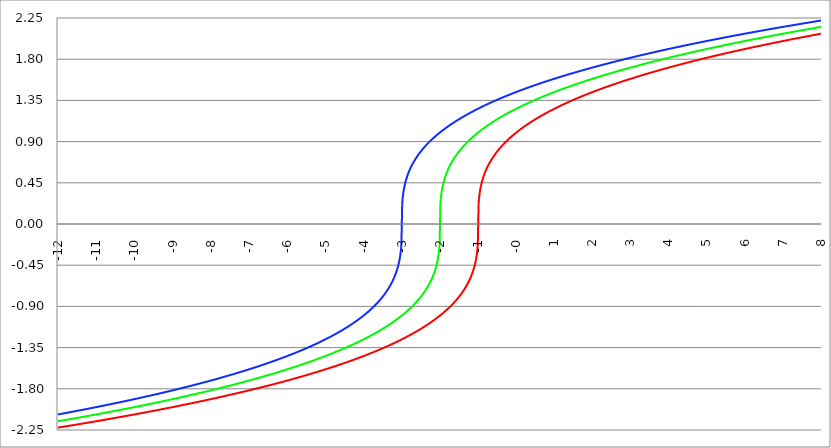
| Category | Series 1 | Series 0 | Series 2 |
|---|---|---|---|
| -12.0 | -2.224 | -2.154 | -2.08 |
| -11.99 | -2.223 | -2.154 | -2.079 |
| -11.98 | -2.223 | -2.153 | -2.079 |
| -11.97 | -2.222 | -2.152 | -2.078 |
| -11.96 | -2.221 | -2.152 | -2.077 |
| -11.95 | -2.221 | -2.151 | -2.076 |
| -11.94 | -2.22 | -2.15 | -2.075 |
| -11.93 | -2.219 | -2.149 | -2.075 |
| -11.92 | -2.219 | -2.149 | -2.074 |
| -11.91 | -2.218 | -2.148 | -2.073 |
| -11.9 | -2.217 | -2.147 | -2.072 |
| -11.89 | -2.217 | -2.147 | -2.072 |
| -11.88 | -2.216 | -2.146 | -2.071 |
| -11.87 | -2.215 | -2.145 | -2.07 |
| -11.86 | -2.215 | -2.144 | -2.069 |
| -11.85 | -2.214 | -2.144 | -2.068 |
| -11.84 | -2.213 | -2.143 | -2.068 |
| -11.83 | -2.212 | -2.142 | -2.067 |
| -11.82 | -2.212 | -2.141 | -2.066 |
| -11.81 | -2.211 | -2.141 | -2.065 |
| -11.8 | -2.21 | -2.14 | -2.065 |
| -11.79 | -2.21 | -2.139 | -2.064 |
| -11.78 | -2.209 | -2.139 | -2.063 |
| -11.77 | -2.208 | -2.138 | -2.062 |
| -11.76000000000001 | -2.208 | -2.137 | -2.061 |
| -11.75000000000001 | -2.207 | -2.136 | -2.061 |
| -11.74000000000001 | -2.206 | -2.136 | -2.06 |
| -11.73000000000001 | -2.206 | -2.135 | -2.059 |
| -11.72000000000001 | -2.205 | -2.134 | -2.058 |
| -11.71000000000001 | -2.204 | -2.133 | -2.057 |
| -11.70000000000001 | -2.204 | -2.133 | -2.057 |
| -11.69000000000001 | -2.203 | -2.132 | -2.056 |
| -11.68000000000001 | -2.202 | -2.131 | -2.055 |
| -11.67000000000001 | -2.202 | -2.13 | -2.054 |
| -11.66000000000001 | -2.201 | -2.13 | -2.054 |
| -11.65000000000001 | -2.2 | -2.129 | -2.053 |
| -11.64000000000001 | -2.199 | -2.128 | -2.052 |
| -11.63000000000001 | -2.199 | -2.128 | -2.051 |
| -11.62000000000001 | -2.198 | -2.127 | -2.05 |
| -11.61000000000001 | -2.197 | -2.126 | -2.05 |
| -11.60000000000001 | -2.197 | -2.125 | -2.049 |
| -11.59000000000001 | -2.196 | -2.125 | -2.048 |
| -11.58000000000001 | -2.195 | -2.124 | -2.047 |
| -11.57000000000001 | -2.195 | -2.123 | -2.046 |
| -11.56000000000001 | -2.194 | -2.122 | -2.046 |
| -11.55000000000001 | -2.193 | -2.122 | -2.045 |
| -11.54000000000001 | -2.193 | -2.121 | -2.044 |
| -11.53000000000001 | -2.192 | -2.12 | -2.043 |
| -11.52000000000001 | -2.191 | -2.119 | -2.042 |
| -11.51000000000001 | -2.19 | -2.119 | -2.042 |
| -11.50000000000001 | -2.19 | -2.118 | -2.041 |
| -11.49000000000001 | -2.189 | -2.117 | -2.04 |
| -11.48000000000001 | -2.188 | -2.116 | -2.039 |
| -11.47000000000001 | -2.188 | -2.116 | -2.038 |
| -11.46000000000001 | -2.187 | -2.115 | -2.038 |
| -11.45000000000001 | -2.186 | -2.114 | -2.037 |
| -11.44000000000001 | -2.186 | -2.113 | -2.036 |
| -11.43000000000001 | -2.185 | -2.113 | -2.035 |
| -11.42000000000001 | -2.184 | -2.112 | -2.034 |
| -11.41000000000001 | -2.183 | -2.111 | -2.034 |
| -11.40000000000001 | -2.183 | -2.11 | -2.033 |
| -11.39000000000001 | -2.182 | -2.11 | -2.032 |
| -11.38000000000001 | -2.181 | -2.109 | -2.031 |
| -11.37000000000001 | -2.181 | -2.108 | -2.03 |
| -11.36000000000001 | -2.18 | -2.107 | -2.03 |
| -11.35000000000001 | -2.179 | -2.107 | -2.029 |
| -11.34000000000001 | -2.179 | -2.106 | -2.028 |
| -11.33000000000001 | -2.178 | -2.105 | -2.027 |
| -11.32000000000001 | -2.177 | -2.104 | -2.026 |
| -11.31000000000001 | -2.176 | -2.104 | -2.026 |
| -11.30000000000001 | -2.176 | -2.103 | -2.025 |
| -11.29000000000002 | -2.175 | -2.102 | -2.024 |
| -11.28000000000002 | -2.174 | -2.101 | -2.023 |
| -11.27000000000002 | -2.174 | -2.101 | -2.022 |
| -11.26000000000002 | -2.173 | -2.1 | -2.021 |
| -11.25000000000002 | -2.172 | -2.099 | -2.021 |
| -11.24000000000002 | -2.172 | -2.098 | -2.02 |
| -11.23000000000002 | -2.171 | -2.098 | -2.019 |
| -11.22000000000002 | -2.17 | -2.097 | -2.018 |
| -11.21000000000002 | -2.169 | -2.096 | -2.017 |
| -11.20000000000002 | -2.169 | -2.095 | -2.017 |
| -11.19000000000002 | -2.168 | -2.095 | -2.016 |
| -11.18000000000002 | -2.167 | -2.094 | -2.015 |
| -11.17000000000002 | -2.167 | -2.093 | -2.014 |
| -11.16000000000002 | -2.166 | -2.092 | -2.013 |
| -11.15000000000002 | -2.165 | -2.092 | -2.012 |
| -11.14000000000002 | -2.164 | -2.091 | -2.012 |
| -11.13000000000002 | -2.164 | -2.09 | -2.011 |
| -11.12000000000002 | -2.163 | -2.089 | -2.01 |
| -11.11000000000002 | -2.162 | -2.089 | -2.009 |
| -11.10000000000002 | -2.162 | -2.088 | -2.008 |
| -11.09000000000002 | -2.161 | -2.087 | -2.007 |
| -11.08000000000002 | -2.16 | -2.086 | -2.007 |
| -11.07000000000002 | -2.159 | -2.085 | -2.006 |
| -11.06000000000002 | -2.159 | -2.085 | -2.005 |
| -11.05000000000002 | -2.158 | -2.084 | -2.004 |
| -11.04000000000002 | -2.157 | -2.083 | -2.003 |
| -11.03000000000002 | -2.157 | -2.082 | -2.002 |
| -11.02000000000002 | -2.156 | -2.082 | -2.002 |
| -11.01000000000002 | -2.155 | -2.081 | -2.001 |
| -11.00000000000002 | -2.154 | -2.08 | -2 |
| -10.99000000000002 | -2.154 | -2.079 | -1.999 |
| -10.98000000000002 | -2.153 | -2.079 | -1.998 |
| -10.97000000000002 | -2.152 | -2.078 | -1.997 |
| -10.96000000000002 | -2.152 | -2.077 | -1.997 |
| -10.95000000000002 | -2.151 | -2.076 | -1.996 |
| -10.94000000000002 | -2.15 | -2.075 | -1.995 |
| -10.93000000000002 | -2.149 | -2.075 | -1.994 |
| -10.92000000000002 | -2.149 | -2.074 | -1.993 |
| -10.91000000000002 | -2.148 | -2.073 | -1.992 |
| -10.90000000000002 | -2.147 | -2.072 | -1.992 |
| -10.89000000000002 | -2.147 | -2.072 | -1.991 |
| -10.88000000000002 | -2.146 | -2.071 | -1.99 |
| -10.87000000000002 | -2.145 | -2.07 | -1.989 |
| -10.86000000000002 | -2.144 | -2.069 | -1.988 |
| -10.85000000000002 | -2.144 | -2.068 | -1.987 |
| -10.84000000000002 | -2.143 | -2.068 | -1.987 |
| -10.83000000000002 | -2.142 | -2.067 | -1.986 |
| -10.82000000000003 | -2.141 | -2.066 | -1.985 |
| -10.81000000000003 | -2.141 | -2.065 | -1.984 |
| -10.80000000000003 | -2.14 | -2.065 | -1.983 |
| -10.79000000000003 | -2.139 | -2.064 | -1.982 |
| -10.78000000000003 | -2.139 | -2.063 | -1.981 |
| -10.77000000000003 | -2.138 | -2.062 | -1.981 |
| -10.76000000000003 | -2.137 | -2.061 | -1.98 |
| -10.75000000000003 | -2.136 | -2.061 | -1.979 |
| -10.74000000000003 | -2.136 | -2.06 | -1.978 |
| -10.73000000000003 | -2.135 | -2.059 | -1.977 |
| -10.72000000000003 | -2.134 | -2.058 | -1.976 |
| -10.71000000000003 | -2.133 | -2.057 | -1.976 |
| -10.70000000000003 | -2.133 | -2.057 | -1.975 |
| -10.69000000000003 | -2.132 | -2.056 | -1.974 |
| -10.68000000000003 | -2.131 | -2.055 | -1.973 |
| -10.67000000000003 | -2.13 | -2.054 | -1.972 |
| -10.66000000000003 | -2.13 | -2.054 | -1.971 |
| -10.65000000000003 | -2.129 | -2.053 | -1.97 |
| -10.64000000000003 | -2.128 | -2.052 | -1.97 |
| -10.63000000000003 | -2.128 | -2.051 | -1.969 |
| -10.62000000000003 | -2.127 | -2.05 | -1.968 |
| -10.61000000000003 | -2.126 | -2.05 | -1.967 |
| -10.60000000000003 | -2.125 | -2.049 | -1.966 |
| -10.59000000000003 | -2.125 | -2.048 | -1.965 |
| -10.58000000000003 | -2.124 | -2.047 | -1.964 |
| -10.57000000000003 | -2.123 | -2.046 | -1.964 |
| -10.56000000000003 | -2.122 | -2.046 | -1.963 |
| -10.55000000000003 | -2.122 | -2.045 | -1.962 |
| -10.54000000000003 | -2.121 | -2.044 | -1.961 |
| -10.53000000000003 | -2.12 | -2.043 | -1.96 |
| -10.52000000000003 | -2.119 | -2.042 | -1.959 |
| -10.51000000000003 | -2.119 | -2.042 | -1.958 |
| -10.50000000000003 | -2.118 | -2.041 | -1.957 |
| -10.49000000000003 | -2.117 | -2.04 | -1.957 |
| -10.48000000000003 | -2.116 | -2.039 | -1.956 |
| -10.47000000000003 | -2.116 | -2.038 | -1.955 |
| -10.46000000000003 | -2.115 | -2.038 | -1.954 |
| -10.45000000000003 | -2.114 | -2.037 | -1.953 |
| -10.44000000000003 | -2.113 | -2.036 | -1.952 |
| -10.43000000000003 | -2.113 | -2.035 | -1.951 |
| -10.42000000000003 | -2.112 | -2.034 | -1.95 |
| -10.41000000000003 | -2.111 | -2.034 | -1.95 |
| -10.40000000000003 | -2.11 | -2.033 | -1.949 |
| -10.39000000000003 | -2.11 | -2.032 | -1.948 |
| -10.38000000000003 | -2.109 | -2.031 | -1.947 |
| -10.37000000000003 | -2.108 | -2.03 | -1.946 |
| -10.36000000000003 | -2.107 | -2.03 | -1.945 |
| -10.35000000000004 | -2.107 | -2.029 | -1.944 |
| -10.34000000000004 | -2.106 | -2.028 | -1.943 |
| -10.33000000000004 | -2.105 | -2.027 | -1.943 |
| -10.32000000000004 | -2.104 | -2.026 | -1.942 |
| -10.31000000000004 | -2.104 | -2.026 | -1.941 |
| -10.30000000000004 | -2.103 | -2.025 | -1.94 |
| -10.29000000000004 | -2.102 | -2.024 | -1.939 |
| -10.28000000000004 | -2.101 | -2.023 | -1.938 |
| -10.27000000000004 | -2.101 | -2.022 | -1.937 |
| -10.26000000000004 | -2.1 | -2.021 | -1.936 |
| -10.25000000000004 | -2.099 | -2.021 | -1.935 |
| -10.24000000000004 | -2.098 | -2.02 | -1.935 |
| -10.23000000000004 | -2.098 | -2.019 | -1.934 |
| -10.22000000000004 | -2.097 | -2.018 | -1.933 |
| -10.21000000000004 | -2.096 | -2.017 | -1.932 |
| -10.20000000000004 | -2.095 | -2.017 | -1.931 |
| -10.19000000000004 | -2.095 | -2.016 | -1.93 |
| -10.18000000000004 | -2.094 | -2.015 | -1.929 |
| -10.17000000000004 | -2.093 | -2.014 | -1.928 |
| -10.16000000000004 | -2.092 | -2.013 | -1.927 |
| -10.15000000000004 | -2.092 | -2.012 | -1.926 |
| -10.14000000000004 | -2.091 | -2.012 | -1.926 |
| -10.13000000000004 | -2.09 | -2.011 | -1.925 |
| -10.12000000000004 | -2.089 | -2.01 | -1.924 |
| -10.11000000000004 | -2.089 | -2.009 | -1.923 |
| -10.10000000000004 | -2.088 | -2.008 | -1.922 |
| -10.09000000000004 | -2.087 | -2.007 | -1.921 |
| -10.08000000000004 | -2.086 | -2.007 | -1.92 |
| -10.07000000000004 | -2.085 | -2.006 | -1.919 |
| -10.06000000000004 | -2.085 | -2.005 | -1.918 |
| -10.05000000000004 | -2.084 | -2.004 | -1.917 |
| -10.04000000000004 | -2.083 | -2.003 | -1.917 |
| -10.03000000000004 | -2.082 | -2.002 | -1.916 |
| -10.02000000000004 | -2.082 | -2.002 | -1.915 |
| -10.01000000000004 | -2.081 | -2.001 | -1.914 |
| -10.00000000000004 | -2.08 | -2 | -1.913 |
| -9.990000000000043 | -2.079 | -1.999 | -1.912 |
| -9.980000000000043 | -2.079 | -1.998 | -1.911 |
| -9.970000000000043 | -2.078 | -1.997 | -1.91 |
| -9.960000000000043 | -2.077 | -1.997 | -1.909 |
| -9.950000000000044 | -2.076 | -1.996 | -1.908 |
| -9.940000000000042 | -2.075 | -1.995 | -1.907 |
| -9.930000000000044 | -2.075 | -1.994 | -1.907 |
| -9.920000000000044 | -2.074 | -1.993 | -1.906 |
| -9.910000000000045 | -2.073 | -1.992 | -1.905 |
| -9.900000000000045 | -2.072 | -1.992 | -1.904 |
| -9.890000000000043 | -2.072 | -1.991 | -1.903 |
| -9.880000000000045 | -2.071 | -1.99 | -1.902 |
| -9.870000000000045 | -2.07 | -1.989 | -1.901 |
| -9.860000000000046 | -2.069 | -1.988 | -1.9 |
| -9.850000000000046 | -2.068 | -1.987 | -1.899 |
| -9.840000000000044 | -2.068 | -1.987 | -1.898 |
| -9.830000000000046 | -2.067 | -1.986 | -1.897 |
| -9.820000000000046 | -2.066 | -1.985 | -1.896 |
| -9.810000000000047 | -2.065 | -1.984 | -1.895 |
| -9.800000000000045 | -2.065 | -1.983 | -1.895 |
| -9.790000000000047 | -2.064 | -1.982 | -1.894 |
| -9.780000000000047 | -2.063 | -1.981 | -1.893 |
| -9.770000000000048 | -2.062 | -1.981 | -1.892 |
| -9.760000000000048 | -2.061 | -1.98 | -1.891 |
| -9.750000000000046 | -2.061 | -1.979 | -1.89 |
| -9.740000000000048 | -2.06 | -1.978 | -1.889 |
| -9.730000000000048 | -2.059 | -1.977 | -1.888 |
| -9.720000000000049 | -2.058 | -1.976 | -1.887 |
| -9.710000000000049 | -2.057 | -1.976 | -1.886 |
| -9.700000000000047 | -2.057 | -1.975 | -1.885 |
| -9.69000000000005 | -2.056 | -1.974 | -1.884 |
| -9.68000000000005 | -2.055 | -1.973 | -1.883 |
| -9.67000000000005 | -2.054 | -1.972 | -1.882 |
| -9.66000000000005 | -2.054 | -1.971 | -1.881 |
| -9.65000000000005 | -2.053 | -1.97 | -1.881 |
| -9.64000000000005 | -2.052 | -1.97 | -1.88 |
| -9.63000000000005 | -2.051 | -1.969 | -1.879 |
| -9.62000000000005 | -2.05 | -1.968 | -1.878 |
| -9.610000000000051 | -2.05 | -1.967 | -1.877 |
| -9.600000000000051 | -2.049 | -1.966 | -1.876 |
| -9.590000000000051 | -2.048 | -1.965 | -1.875 |
| -9.580000000000052 | -2.047 | -1.964 | -1.874 |
| -9.570000000000052 | -2.046 | -1.964 | -1.873 |
| -9.560000000000052 | -2.046 | -1.963 | -1.872 |
| -9.550000000000052 | -2.045 | -1.962 | -1.871 |
| -9.540000000000052 | -2.044 | -1.961 | -1.87 |
| -9.530000000000053 | -2.043 | -1.96 | -1.869 |
| -9.520000000000053 | -2.042 | -1.959 | -1.868 |
| -9.510000000000053 | -2.042 | -1.958 | -1.867 |
| -9.500000000000053 | -2.041 | -1.957 | -1.866 |
| -9.490000000000054 | -2.04 | -1.957 | -1.865 |
| -9.480000000000054 | -2.039 | -1.956 | -1.864 |
| -9.470000000000052 | -2.038 | -1.955 | -1.863 |
| -9.460000000000054 | -2.038 | -1.954 | -1.862 |
| -9.450000000000054 | -2.037 | -1.953 | -1.861 |
| -9.440000000000055 | -2.036 | -1.952 | -1.86 |
| -9.430000000000055 | -2.035 | -1.951 | -1.86 |
| -9.420000000000055 | -2.034 | -1.95 | -1.859 |
| -9.410000000000055 | -2.034 | -1.95 | -1.858 |
| -9.400000000000055 | -2.033 | -1.949 | -1.857 |
| -9.390000000000056 | -2.032 | -1.948 | -1.856 |
| -9.380000000000056 | -2.031 | -1.947 | -1.855 |
| -9.370000000000056 | -2.03 | -1.946 | -1.854 |
| -9.360000000000056 | -2.03 | -1.945 | -1.853 |
| -9.350000000000056 | -2.029 | -1.944 | -1.852 |
| -9.340000000000057 | -2.028 | -1.943 | -1.851 |
| -9.330000000000057 | -2.027 | -1.943 | -1.85 |
| -9.320000000000057 | -2.026 | -1.942 | -1.849 |
| -9.310000000000057 | -2.026 | -1.941 | -1.848 |
| -9.300000000000058 | -2.025 | -1.94 | -1.847 |
| -9.290000000000058 | -2.024 | -1.939 | -1.846 |
| -9.280000000000058 | -2.023 | -1.938 | -1.845 |
| -9.270000000000058 | -2.022 | -1.937 | -1.844 |
| -9.260000000000058 | -2.021 | -1.936 | -1.843 |
| -9.250000000000059 | -2.021 | -1.935 | -1.842 |
| -9.240000000000059 | -2.02 | -1.935 | -1.841 |
| -9.230000000000059 | -2.019 | -1.934 | -1.84 |
| -9.22000000000006 | -2.018 | -1.933 | -1.839 |
| -9.21000000000006 | -2.017 | -1.932 | -1.838 |
| -9.20000000000006 | -2.017 | -1.931 | -1.837 |
| -9.19000000000006 | -2.016 | -1.93 | -1.836 |
| -9.18000000000006 | -2.015 | -1.929 | -1.835 |
| -9.17000000000006 | -2.014 | -1.928 | -1.834 |
| -9.16000000000006 | -2.013 | -1.927 | -1.833 |
| -9.15000000000006 | -2.012 | -1.926 | -1.832 |
| -9.140000000000061 | -2.012 | -1.926 | -1.831 |
| -9.130000000000061 | -2.011 | -1.925 | -1.83 |
| -9.120000000000061 | -2.01 | -1.924 | -1.829 |
| -9.110000000000062 | -2.009 | -1.923 | -1.828 |
| -9.100000000000062 | -2.008 | -1.922 | -1.827 |
| -9.090000000000062 | -2.007 | -1.921 | -1.826 |
| -9.080000000000062 | -2.007 | -1.92 | -1.825 |
| -9.070000000000062 | -2.006 | -1.919 | -1.824 |
| -9.060000000000063 | -2.005 | -1.918 | -1.823 |
| -9.050000000000063 | -2.004 | -1.917 | -1.822 |
| -9.040000000000063 | -2.003 | -1.917 | -1.821 |
| -9.030000000000063 | -2.002 | -1.916 | -1.82 |
| -9.020000000000064 | -2.002 | -1.915 | -1.819 |
| -9.010000000000064 | -2.001 | -1.914 | -1.818 |
| -9.000000000000062 | -2 | -1.913 | -1.817 |
| -8.990000000000064 | -1.999 | -1.912 | -1.816 |
| -8.980000000000064 | -1.998 | -1.911 | -1.815 |
| -8.970000000000065 | -1.997 | -1.91 | -1.814 |
| -8.960000000000065 | -1.997 | -1.909 | -1.813 |
| -8.950000000000063 | -1.996 | -1.908 | -1.812 |
| -8.940000000000065 | -1.995 | -1.907 | -1.811 |
| -8.930000000000065 | -1.994 | -1.907 | -1.81 |
| -8.920000000000066 | -1.993 | -1.906 | -1.809 |
| -8.910000000000066 | -1.992 | -1.905 | -1.808 |
| -8.900000000000066 | -1.992 | -1.904 | -1.807 |
| -8.890000000000066 | -1.991 | -1.903 | -1.806 |
| -8.880000000000067 | -1.99 | -1.902 | -1.805 |
| -8.870000000000067 | -1.989 | -1.901 | -1.804 |
| -8.860000000000065 | -1.988 | -1.9 | -1.803 |
| -8.850000000000067 | -1.987 | -1.899 | -1.802 |
| -8.840000000000067 | -1.987 | -1.898 | -1.801 |
| -8.830000000000068 | -1.986 | -1.897 | -1.8 |
| -8.820000000000068 | -1.985 | -1.896 | -1.799 |
| -8.810000000000066 | -1.984 | -1.895 | -1.798 |
| -8.800000000000068 | -1.983 | -1.895 | -1.797 |
| -8.790000000000068 | -1.982 | -1.894 | -1.796 |
| -8.780000000000069 | -1.981 | -1.893 | -1.795 |
| -8.770000000000069 | -1.981 | -1.892 | -1.794 |
| -8.760000000000067 | -1.98 | -1.891 | -1.793 |
| -8.75000000000007 | -1.979 | -1.89 | -1.792 |
| -8.74000000000007 | -1.978 | -1.889 | -1.79 |
| -8.73000000000007 | -1.977 | -1.888 | -1.789 |
| -8.72000000000007 | -1.976 | -1.887 | -1.788 |
| -8.71000000000007 | -1.976 | -1.886 | -1.787 |
| -8.70000000000007 | -1.975 | -1.885 | -1.786 |
| -8.69000000000007 | -1.974 | -1.884 | -1.785 |
| -8.68000000000007 | -1.973 | -1.883 | -1.784 |
| -8.670000000000071 | -1.972 | -1.882 | -1.783 |
| -8.660000000000071 | -1.971 | -1.881 | -1.782 |
| -8.650000000000071 | -1.97 | -1.881 | -1.781 |
| -8.640000000000072 | -1.97 | -1.88 | -1.78 |
| -8.630000000000072 | -1.969 | -1.879 | -1.779 |
| -8.620000000000072 | -1.968 | -1.878 | -1.778 |
| -8.610000000000072 | -1.967 | -1.877 | -1.777 |
| -8.600000000000072 | -1.966 | -1.876 | -1.776 |
| -8.590000000000073 | -1.965 | -1.875 | -1.775 |
| -8.580000000000073 | -1.964 | -1.874 | -1.774 |
| -8.570000000000073 | -1.964 | -1.873 | -1.773 |
| -8.560000000000073 | -1.963 | -1.872 | -1.772 |
| -8.550000000000074 | -1.962 | -1.871 | -1.771 |
| -8.540000000000074 | -1.961 | -1.87 | -1.769 |
| -8.530000000000074 | -1.96 | -1.869 | -1.768 |
| -8.520000000000074 | -1.959 | -1.868 | -1.767 |
| -8.510000000000074 | -1.958 | -1.867 | -1.766 |
| -8.500000000000075 | -1.957 | -1.866 | -1.765 |
| -8.490000000000075 | -1.957 | -1.865 | -1.764 |
| -8.480000000000075 | -1.956 | -1.864 | -1.763 |
| -8.470000000000075 | -1.955 | -1.863 | -1.762 |
| -8.460000000000075 | -1.954 | -1.862 | -1.761 |
| -8.450000000000076 | -1.953 | -1.861 | -1.76 |
| -8.440000000000076 | -1.952 | -1.86 | -1.759 |
| -8.430000000000076 | -1.951 | -1.86 | -1.758 |
| -8.420000000000076 | -1.95 | -1.859 | -1.757 |
| -8.410000000000077 | -1.95 | -1.858 | -1.755 |
| -8.400000000000077 | -1.949 | -1.857 | -1.754 |
| -8.390000000000077 | -1.948 | -1.856 | -1.753 |
| -8.380000000000077 | -1.947 | -1.855 | -1.752 |
| -8.370000000000077 | -1.946 | -1.854 | -1.751 |
| -8.360000000000078 | -1.945 | -1.853 | -1.75 |
| -8.350000000000078 | -1.944 | -1.852 | -1.749 |
| -8.340000000000078 | -1.943 | -1.851 | -1.748 |
| -8.330000000000078 | -1.943 | -1.85 | -1.747 |
| -8.320000000000078 | -1.942 | -1.849 | -1.746 |
| -8.310000000000079 | -1.941 | -1.848 | -1.745 |
| -8.300000000000079 | -1.94 | -1.847 | -1.744 |
| -8.290000000000079 | -1.939 | -1.846 | -1.742 |
| -8.28000000000008 | -1.938 | -1.845 | -1.741 |
| -8.27000000000008 | -1.937 | -1.844 | -1.74 |
| -8.26000000000008 | -1.936 | -1.843 | -1.739 |
| -8.25000000000008 | -1.935 | -1.842 | -1.738 |
| -8.24000000000008 | -1.935 | -1.841 | -1.737 |
| -8.23000000000008 | -1.934 | -1.84 | -1.736 |
| -8.22000000000008 | -1.933 | -1.839 | -1.735 |
| -8.21000000000008 | -1.932 | -1.838 | -1.734 |
| -8.200000000000081 | -1.931 | -1.837 | -1.732 |
| -8.190000000000081 | -1.93 | -1.836 | -1.731 |
| -8.180000000000081 | -1.929 | -1.835 | -1.73 |
| -8.170000000000082 | -1.928 | -1.834 | -1.729 |
| -8.160000000000082 | -1.927 | -1.833 | -1.728 |
| -8.150000000000082 | -1.926 | -1.832 | -1.727 |
| -8.140000000000082 | -1.926 | -1.831 | -1.726 |
| -8.130000000000082 | -1.925 | -1.83 | -1.725 |
| -8.120000000000083 | -1.924 | -1.829 | -1.724 |
| -8.110000000000083 | -1.923 | -1.828 | -1.722 |
| -8.100000000000083 | -1.922 | -1.827 | -1.721 |
| -8.090000000000083 | -1.921 | -1.826 | -1.72 |
| -8.080000000000084 | -1.92 | -1.825 | -1.719 |
| -8.070000000000084 | -1.919 | -1.824 | -1.718 |
| -8.060000000000082 | -1.918 | -1.823 | -1.717 |
| -8.050000000000084 | -1.917 | -1.822 | -1.716 |
| -8.040000000000084 | -1.917 | -1.821 | -1.715 |
| -8.030000000000085 | -1.916 | -1.82 | -1.713 |
| -8.020000000000085 | -1.915 | -1.819 | -1.712 |
| -8.010000000000085 | -1.914 | -1.818 | -1.711 |
| -8.000000000000085 | -1.913 | -1.817 | -1.71 |
| -7.990000000000085 | -1.912 | -1.816 | -1.709 |
| -7.980000000000085 | -1.911 | -1.815 | -1.708 |
| -7.970000000000085 | -1.91 | -1.814 | -1.707 |
| -7.960000000000086 | -1.909 | -1.813 | -1.705 |
| -7.950000000000086 | -1.908 | -1.812 | -1.704 |
| -7.940000000000086 | -1.907 | -1.811 | -1.703 |
| -7.930000000000086 | -1.907 | -1.81 | -1.702 |
| -7.920000000000087 | -1.906 | -1.809 | -1.701 |
| -7.910000000000087 | -1.905 | -1.808 | -1.7 |
| -7.900000000000087 | -1.904 | -1.807 | -1.698 |
| -7.890000000000088 | -1.903 | -1.806 | -1.697 |
| -7.880000000000088 | -1.902 | -1.805 | -1.696 |
| -7.870000000000088 | -1.901 | -1.804 | -1.695 |
| -7.860000000000088 | -1.9 | -1.803 | -1.694 |
| -7.850000000000088 | -1.899 | -1.802 | -1.693 |
| -7.840000000000089 | -1.898 | -1.801 | -1.692 |
| -7.830000000000089 | -1.897 | -1.8 | -1.69 |
| -7.820000000000089 | -1.896 | -1.799 | -1.689 |
| -7.810000000000089 | -1.895 | -1.798 | -1.688 |
| -7.800000000000089 | -1.895 | -1.797 | -1.687 |
| -7.79000000000009 | -1.894 | -1.796 | -1.686 |
| -7.78000000000009 | -1.893 | -1.795 | -1.685 |
| -7.77000000000009 | -1.892 | -1.794 | -1.683 |
| -7.76000000000009 | -1.891 | -1.793 | -1.682 |
| -7.750000000000091 | -1.89 | -1.792 | -1.681 |
| -7.740000000000091 | -1.889 | -1.79 | -1.68 |
| -7.730000000000091 | -1.888 | -1.789 | -1.679 |
| -7.720000000000091 | -1.887 | -1.788 | -1.677 |
| -7.710000000000091 | -1.886 | -1.787 | -1.676 |
| -7.700000000000092 | -1.885 | -1.786 | -1.675 |
| -7.690000000000092 | -1.884 | -1.785 | -1.674 |
| -7.680000000000092 | -1.883 | -1.784 | -1.673 |
| -7.670000000000092 | -1.882 | -1.783 | -1.671 |
| -7.660000000000092 | -1.881 | -1.782 | -1.67 |
| -7.650000000000093 | -1.881 | -1.781 | -1.669 |
| -7.640000000000093 | -1.88 | -1.78 | -1.668 |
| -7.630000000000093 | -1.879 | -1.779 | -1.667 |
| -7.620000000000093 | -1.878 | -1.778 | -1.666 |
| -7.610000000000093 | -1.877 | -1.777 | -1.664 |
| -7.600000000000094 | -1.876 | -1.776 | -1.663 |
| -7.590000000000094 | -1.875 | -1.775 | -1.662 |
| -7.580000000000094 | -1.874 | -1.774 | -1.661 |
| -7.570000000000094 | -1.873 | -1.773 | -1.659 |
| -7.560000000000095 | -1.872 | -1.772 | -1.658 |
| -7.550000000000095 | -1.871 | -1.771 | -1.657 |
| -7.540000000000095 | -1.87 | -1.769 | -1.656 |
| -7.530000000000095 | -1.869 | -1.768 | -1.655 |
| -7.520000000000095 | -1.868 | -1.767 | -1.653 |
| -7.510000000000096 | -1.867 | -1.766 | -1.652 |
| -7.500000000000096 | -1.866 | -1.765 | -1.651 |
| -7.490000000000096 | -1.865 | -1.764 | -1.65 |
| -7.480000000000096 | -1.864 | -1.763 | -1.649 |
| -7.470000000000096 | -1.863 | -1.762 | -1.647 |
| -7.460000000000097 | -1.862 | -1.761 | -1.646 |
| -7.450000000000097 | -1.861 | -1.76 | -1.645 |
| -7.440000000000097 | -1.86 | -1.759 | -1.644 |
| -7.430000000000097 | -1.86 | -1.758 | -1.642 |
| -7.420000000000098 | -1.859 | -1.757 | -1.641 |
| -7.410000000000098 | -1.858 | -1.755 | -1.64 |
| -7.400000000000098 | -1.857 | -1.754 | -1.639 |
| -7.390000000000098 | -1.856 | -1.753 | -1.637 |
| -7.380000000000098 | -1.855 | -1.752 | -1.636 |
| -7.370000000000099 | -1.854 | -1.751 | -1.635 |
| -7.360000000000099 | -1.853 | -1.75 | -1.634 |
| -7.350000000000099 | -1.852 | -1.749 | -1.632 |
| -7.340000000000099 | -1.851 | -1.748 | -1.631 |
| -7.330000000000099 | -1.85 | -1.747 | -1.63 |
| -7.3200000000001 | -1.849 | -1.746 | -1.629 |
| -7.3100000000001 | -1.848 | -1.745 | -1.627 |
| -7.3000000000001 | -1.847 | -1.744 | -1.626 |
| -7.2900000000001 | -1.846 | -1.742 | -1.625 |
| -7.2800000000001 | -1.845 | -1.741 | -1.624 |
| -7.2700000000001 | -1.844 | -1.74 | -1.622 |
| -7.260000000000101 | -1.843 | -1.739 | -1.621 |
| -7.250000000000101 | -1.842 | -1.738 | -1.62 |
| -7.240000000000101 | -1.841 | -1.737 | -1.619 |
| -7.230000000000101 | -1.84 | -1.736 | -1.617 |
| -7.220000000000102 | -1.839 | -1.735 | -1.616 |
| -7.210000000000102 | -1.838 | -1.734 | -1.615 |
| -7.200000000000102 | -1.837 | -1.732 | -1.613 |
| -7.190000000000103 | -1.836 | -1.731 | -1.612 |
| -7.180000000000103 | -1.835 | -1.73 | -1.611 |
| -7.170000000000103 | -1.834 | -1.729 | -1.61 |
| -7.160000000000103 | -1.833 | -1.728 | -1.608 |
| -7.150000000000103 | -1.832 | -1.727 | -1.607 |
| -7.140000000000104 | -1.831 | -1.726 | -1.606 |
| -7.130000000000104 | -1.83 | -1.725 | -1.604 |
| -7.120000000000104 | -1.829 | -1.724 | -1.603 |
| -7.110000000000104 | -1.828 | -1.722 | -1.602 |
| -7.100000000000104 | -1.827 | -1.721 | -1.601 |
| -7.090000000000104 | -1.826 | -1.72 | -1.599 |
| -7.080000000000104 | -1.825 | -1.719 | -1.598 |
| -7.070000000000105 | -1.824 | -1.718 | -1.597 |
| -7.060000000000105 | -1.823 | -1.717 | -1.595 |
| -7.050000000000105 | -1.822 | -1.716 | -1.594 |
| -7.040000000000105 | -1.821 | -1.715 | -1.593 |
| -7.030000000000105 | -1.82 | -1.713 | -1.591 |
| -7.020000000000106 | -1.819 | -1.712 | -1.59 |
| -7.010000000000106 | -1.818 | -1.711 | -1.589 |
| -7.000000000000106 | -1.817 | -1.71 | -1.587 |
| -6.990000000000106 | -1.816 | -1.709 | -1.586 |
| -6.980000000000106 | -1.815 | -1.708 | -1.585 |
| -6.970000000000107 | -1.814 | -1.707 | -1.583 |
| -6.960000000000107 | -1.813 | -1.705 | -1.582 |
| -6.950000000000107 | -1.812 | -1.704 | -1.581 |
| -6.940000000000107 | -1.811 | -1.703 | -1.579 |
| -6.930000000000108 | -1.81 | -1.702 | -1.578 |
| -6.920000000000108 | -1.809 | -1.701 | -1.577 |
| -6.910000000000108 | -1.808 | -1.7 | -1.575 |
| -6.900000000000108 | -1.807 | -1.698 | -1.574 |
| -6.890000000000109 | -1.806 | -1.697 | -1.573 |
| -6.88000000000011 | -1.805 | -1.696 | -1.571 |
| -6.87000000000011 | -1.804 | -1.695 | -1.57 |
| -6.86000000000011 | -1.803 | -1.694 | -1.569 |
| -6.85000000000011 | -1.802 | -1.693 | -1.567 |
| -6.84000000000011 | -1.801 | -1.692 | -1.566 |
| -6.83000000000011 | -1.8 | -1.69 | -1.565 |
| -6.82000000000011 | -1.799 | -1.689 | -1.563 |
| -6.810000000000111 | -1.798 | -1.688 | -1.562 |
| -6.800000000000111 | -1.797 | -1.687 | -1.56 |
| -6.790000000000111 | -1.796 | -1.686 | -1.559 |
| -6.780000000000111 | -1.795 | -1.685 | -1.558 |
| -6.770000000000111 | -1.794 | -1.683 | -1.556 |
| -6.760000000000112 | -1.793 | -1.682 | -1.555 |
| -6.750000000000112 | -1.792 | -1.681 | -1.554 |
| -6.740000000000112 | -1.79 | -1.68 | -1.552 |
| -6.730000000000112 | -1.789 | -1.679 | -1.551 |
| -6.720000000000112 | -1.788 | -1.677 | -1.549 |
| -6.710000000000113 | -1.787 | -1.676 | -1.548 |
| -6.700000000000113 | -1.786 | -1.675 | -1.547 |
| -6.690000000000113 | -1.785 | -1.674 | -1.545 |
| -6.680000000000113 | -1.784 | -1.673 | -1.544 |
| -6.670000000000114 | -1.783 | -1.671 | -1.542 |
| -6.660000000000114 | -1.782 | -1.67 | -1.541 |
| -6.650000000000114 | -1.781 | -1.669 | -1.54 |
| -6.640000000000114 | -1.78 | -1.668 | -1.538 |
| -6.630000000000114 | -1.779 | -1.667 | -1.537 |
| -6.620000000000115 | -1.778 | -1.666 | -1.535 |
| -6.610000000000115 | -1.777 | -1.664 | -1.534 |
| -6.600000000000115 | -1.776 | -1.663 | -1.533 |
| -6.590000000000115 | -1.775 | -1.662 | -1.531 |
| -6.580000000000115 | -1.774 | -1.661 | -1.53 |
| -6.570000000000115 | -1.773 | -1.659 | -1.528 |
| -6.560000000000116 | -1.772 | -1.658 | -1.527 |
| -6.550000000000116 | -1.771 | -1.657 | -1.525 |
| -6.540000000000116 | -1.769 | -1.656 | -1.524 |
| -6.530000000000116 | -1.768 | -1.655 | -1.523 |
| -6.520000000000117 | -1.767 | -1.653 | -1.521 |
| -6.510000000000117 | -1.766 | -1.652 | -1.52 |
| -6.500000000000117 | -1.765 | -1.651 | -1.518 |
| -6.490000000000117 | -1.764 | -1.65 | -1.517 |
| -6.480000000000117 | -1.763 | -1.649 | -1.515 |
| -6.470000000000117 | -1.762 | -1.647 | -1.514 |
| -6.460000000000118 | -1.761 | -1.646 | -1.512 |
| -6.450000000000118 | -1.76 | -1.645 | -1.511 |
| -6.440000000000118 | -1.759 | -1.644 | -1.51 |
| -6.430000000000118 | -1.758 | -1.642 | -1.508 |
| -6.420000000000119 | -1.757 | -1.641 | -1.507 |
| -6.41000000000012 | -1.755 | -1.64 | -1.505 |
| -6.40000000000012 | -1.754 | -1.639 | -1.504 |
| -6.39000000000012 | -1.753 | -1.637 | -1.502 |
| -6.38000000000012 | -1.752 | -1.636 | -1.501 |
| -6.37000000000012 | -1.751 | -1.635 | -1.499 |
| -6.36000000000012 | -1.75 | -1.634 | -1.498 |
| -6.35000000000012 | -1.749 | -1.632 | -1.496 |
| -6.34000000000012 | -1.748 | -1.631 | -1.495 |
| -6.33000000000012 | -1.747 | -1.63 | -1.493 |
| -6.320000000000121 | -1.746 | -1.629 | -1.492 |
| -6.310000000000121 | -1.745 | -1.627 | -1.49 |
| -6.300000000000121 | -1.744 | -1.626 | -1.489 |
| -6.290000000000121 | -1.742 | -1.625 | -1.487 |
| -6.280000000000121 | -1.741 | -1.624 | -1.486 |
| -6.270000000000122 | -1.74 | -1.622 | -1.484 |
| -6.260000000000122 | -1.739 | -1.621 | -1.483 |
| -6.250000000000122 | -1.738 | -1.62 | -1.481 |
| -6.240000000000122 | -1.737 | -1.619 | -1.48 |
| -6.230000000000122 | -1.736 | -1.617 | -1.478 |
| -6.220000000000123 | -1.735 | -1.616 | -1.477 |
| -6.210000000000123 | -1.734 | -1.615 | -1.475 |
| -6.200000000000123 | -1.732 | -1.613 | -1.474 |
| -6.190000000000124 | -1.731 | -1.612 | -1.472 |
| -6.180000000000124 | -1.73 | -1.611 | -1.471 |
| -6.170000000000124 | -1.729 | -1.61 | -1.469 |
| -6.160000000000124 | -1.728 | -1.608 | -1.467 |
| -6.150000000000124 | -1.727 | -1.607 | -1.466 |
| -6.140000000000124 | -1.726 | -1.606 | -1.464 |
| -6.130000000000125 | -1.725 | -1.604 | -1.463 |
| -6.120000000000125 | -1.724 | -1.603 | -1.461 |
| -6.110000000000125 | -1.722 | -1.602 | -1.46 |
| -6.100000000000125 | -1.721 | -1.601 | -1.458 |
| -6.090000000000125 | -1.72 | -1.599 | -1.457 |
| -6.080000000000126 | -1.719 | -1.598 | -1.455 |
| -6.070000000000126 | -1.718 | -1.597 | -1.453 |
| -6.060000000000126 | -1.717 | -1.595 | -1.452 |
| -6.050000000000126 | -1.716 | -1.594 | -1.45 |
| -6.040000000000127 | -1.715 | -1.593 | -1.449 |
| -6.030000000000127 | -1.713 | -1.591 | -1.447 |
| -6.020000000000127 | -1.712 | -1.59 | -1.445 |
| -6.010000000000127 | -1.711 | -1.589 | -1.444 |
| -6.000000000000127 | -1.71 | -1.587 | -1.442 |
| -5.990000000000128 | -1.709 | -1.586 | -1.441 |
| -5.980000000000128 | -1.708 | -1.585 | -1.439 |
| -5.970000000000128 | -1.707 | -1.583 | -1.437 |
| -5.960000000000128 | -1.705 | -1.582 | -1.436 |
| -5.950000000000128 | -1.704 | -1.581 | -1.434 |
| -5.94000000000013 | -1.703 | -1.579 | -1.433 |
| -5.93000000000013 | -1.702 | -1.578 | -1.431 |
| -5.92000000000013 | -1.701 | -1.577 | -1.429 |
| -5.91000000000013 | -1.7 | -1.575 | -1.428 |
| -5.90000000000013 | -1.698 | -1.574 | -1.426 |
| -5.89000000000013 | -1.697 | -1.573 | -1.424 |
| -5.88000000000013 | -1.696 | -1.571 | -1.423 |
| -5.87000000000013 | -1.695 | -1.57 | -1.421 |
| -5.860000000000131 | -1.694 | -1.569 | -1.419 |
| -5.850000000000131 | -1.693 | -1.567 | -1.418 |
| -5.840000000000131 | -1.692 | -1.566 | -1.416 |
| -5.830000000000131 | -1.69 | -1.565 | -1.414 |
| -5.820000000000132 | -1.689 | -1.563 | -1.413 |
| -5.810000000000132 | -1.688 | -1.562 | -1.411 |
| -5.800000000000132 | -1.687 | -1.56 | -1.409 |
| -5.790000000000132 | -1.686 | -1.559 | -1.408 |
| -5.780000000000132 | -1.685 | -1.558 | -1.406 |
| -5.770000000000132 | -1.683 | -1.556 | -1.404 |
| -5.760000000000133 | -1.682 | -1.555 | -1.403 |
| -5.750000000000133 | -1.681 | -1.554 | -1.401 |
| -5.740000000000133 | -1.68 | -1.552 | -1.399 |
| -5.730000000000133 | -1.679 | -1.551 | -1.398 |
| -5.720000000000134 | -1.677 | -1.549 | -1.396 |
| -5.710000000000134 | -1.676 | -1.548 | -1.394 |
| -5.700000000000134 | -1.675 | -1.547 | -1.392 |
| -5.690000000000134 | -1.674 | -1.545 | -1.391 |
| -5.680000000000134 | -1.673 | -1.544 | -1.389 |
| -5.670000000000134 | -1.671 | -1.542 | -1.387 |
| -5.660000000000135 | -1.67 | -1.541 | -1.386 |
| -5.650000000000135 | -1.669 | -1.54 | -1.384 |
| -5.640000000000135 | -1.668 | -1.538 | -1.382 |
| -5.630000000000135 | -1.667 | -1.537 | -1.38 |
| -5.620000000000136 | -1.666 | -1.535 | -1.379 |
| -5.610000000000136 | -1.664 | -1.534 | -1.377 |
| -5.600000000000136 | -1.663 | -1.533 | -1.375 |
| -5.590000000000136 | -1.662 | -1.531 | -1.373 |
| -5.580000000000136 | -1.661 | -1.53 | -1.372 |
| -5.570000000000137 | -1.659 | -1.528 | -1.37 |
| -5.560000000000137 | -1.658 | -1.527 | -1.368 |
| -5.550000000000137 | -1.657 | -1.525 | -1.366 |
| -5.540000000000137 | -1.656 | -1.524 | -1.364 |
| -5.530000000000137 | -1.655 | -1.523 | -1.363 |
| -5.520000000000138 | -1.653 | -1.521 | -1.361 |
| -5.510000000000138 | -1.652 | -1.52 | -1.359 |
| -5.500000000000138 | -1.651 | -1.518 | -1.357 |
| -5.490000000000138 | -1.65 | -1.517 | -1.355 |
| -5.480000000000138 | -1.649 | -1.515 | -1.354 |
| -5.47000000000014 | -1.647 | -1.514 | -1.352 |
| -5.46000000000014 | -1.646 | -1.512 | -1.35 |
| -5.45000000000014 | -1.645 | -1.511 | -1.348 |
| -5.44000000000014 | -1.644 | -1.51 | -1.346 |
| -5.43000000000014 | -1.642 | -1.508 | -1.344 |
| -5.42000000000014 | -1.641 | -1.507 | -1.343 |
| -5.41000000000014 | -1.64 | -1.505 | -1.341 |
| -5.40000000000014 | -1.639 | -1.504 | -1.339 |
| -5.390000000000141 | -1.637 | -1.502 | -1.337 |
| -5.380000000000141 | -1.636 | -1.501 | -1.335 |
| -5.370000000000141 | -1.635 | -1.499 | -1.333 |
| -5.360000000000141 | -1.634 | -1.498 | -1.331 |
| -5.350000000000142 | -1.632 | -1.496 | -1.33 |
| -5.340000000000142 | -1.631 | -1.495 | -1.328 |
| -5.330000000000142 | -1.63 | -1.493 | -1.326 |
| -5.320000000000142 | -1.629 | -1.492 | -1.324 |
| -5.310000000000143 | -1.627 | -1.49 | -1.322 |
| -5.300000000000143 | -1.626 | -1.489 | -1.32 |
| -5.290000000000143 | -1.625 | -1.487 | -1.318 |
| -5.280000000000143 | -1.624 | -1.486 | -1.316 |
| -5.270000000000143 | -1.622 | -1.484 | -1.314 |
| -5.260000000000144 | -1.621 | -1.483 | -1.312 |
| -5.250000000000144 | -1.62 | -1.481 | -1.31 |
| -5.240000000000144 | -1.619 | -1.48 | -1.308 |
| -5.230000000000144 | -1.617 | -1.478 | -1.306 |
| -5.220000000000144 | -1.616 | -1.477 | -1.305 |
| -5.210000000000144 | -1.615 | -1.475 | -1.303 |
| -5.200000000000144 | -1.613 | -1.474 | -1.301 |
| -5.190000000000145 | -1.612 | -1.472 | -1.299 |
| -5.180000000000145 | -1.611 | -1.471 | -1.297 |
| -5.170000000000145 | -1.61 | -1.469 | -1.295 |
| -5.160000000000146 | -1.608 | -1.467 | -1.293 |
| -5.150000000000146 | -1.607 | -1.466 | -1.291 |
| -5.140000000000146 | -1.606 | -1.464 | -1.289 |
| -5.130000000000146 | -1.604 | -1.463 | -1.287 |
| -5.120000000000147 | -1.603 | -1.461 | -1.285 |
| -5.110000000000147 | -1.602 | -1.46 | -1.283 |
| -5.100000000000147 | -1.601 | -1.458 | -1.281 |
| -5.090000000000147 | -1.599 | -1.457 | -1.279 |
| -5.080000000000147 | -1.598 | -1.455 | -1.277 |
| -5.070000000000147 | -1.597 | -1.453 | -1.274 |
| -5.060000000000148 | -1.595 | -1.452 | -1.272 |
| -5.050000000000148 | -1.594 | -1.45 | -1.27 |
| -5.040000000000148 | -1.593 | -1.449 | -1.268 |
| -5.030000000000148 | -1.591 | -1.447 | -1.266 |
| -5.020000000000149 | -1.59 | -1.445 | -1.264 |
| -5.010000000000149 | -1.589 | -1.444 | -1.262 |
| -5.00000000000015 | -1.587 | -1.442 | -1.26 |
| -4.99000000000015 | -1.586 | -1.441 | -1.258 |
| -4.98000000000015 | -1.585 | -1.439 | -1.256 |
| -4.97000000000015 | -1.583 | -1.437 | -1.254 |
| -4.96000000000015 | -1.582 | -1.436 | -1.251 |
| -4.95000000000015 | -1.581 | -1.434 | -1.249 |
| -4.94000000000015 | -1.579 | -1.433 | -1.247 |
| -4.93000000000015 | -1.578 | -1.431 | -1.245 |
| -4.920000000000151 | -1.577 | -1.429 | -1.243 |
| -4.910000000000151 | -1.575 | -1.428 | -1.241 |
| -4.900000000000151 | -1.574 | -1.426 | -1.239 |
| -4.890000000000151 | -1.573 | -1.424 | -1.236 |
| -4.880000000000152 | -1.571 | -1.423 | -1.234 |
| -4.870000000000152 | -1.57 | -1.421 | -1.232 |
| -4.860000000000152 | -1.569 | -1.419 | -1.23 |
| -4.850000000000152 | -1.567 | -1.418 | -1.228 |
| -4.840000000000153 | -1.566 | -1.416 | -1.225 |
| -4.830000000000153 | -1.565 | -1.414 | -1.223 |
| -4.820000000000153 | -1.563 | -1.413 | -1.221 |
| -4.810000000000153 | -1.562 | -1.411 | -1.219 |
| -4.800000000000153 | -1.56 | -1.409 | -1.216 |
| -4.790000000000154 | -1.559 | -1.408 | -1.214 |
| -4.780000000000154 | -1.558 | -1.406 | -1.212 |
| -4.770000000000154 | -1.556 | -1.404 | -1.21 |
| -4.760000000000154 | -1.555 | -1.403 | -1.207 |
| -4.750000000000154 | -1.554 | -1.401 | -1.205 |
| -4.740000000000154 | -1.552 | -1.399 | -1.203 |
| -4.730000000000154 | -1.551 | -1.398 | -1.2 |
| -4.720000000000155 | -1.549 | -1.396 | -1.198 |
| -4.710000000000155 | -1.548 | -1.394 | -1.196 |
| -4.700000000000155 | -1.547 | -1.392 | -1.193 |
| -4.690000000000156 | -1.545 | -1.391 | -1.191 |
| -4.680000000000156 | -1.544 | -1.389 | -1.189 |
| -4.670000000000156 | -1.542 | -1.387 | -1.186 |
| -4.660000000000156 | -1.541 | -1.386 | -1.184 |
| -4.650000000000157 | -1.54 | -1.384 | -1.182 |
| -4.640000000000157 | -1.538 | -1.382 | -1.179 |
| -4.630000000000157 | -1.537 | -1.38 | -1.177 |
| -4.620000000000157 | -1.535 | -1.379 | -1.174 |
| -4.610000000000157 | -1.534 | -1.377 | -1.172 |
| -4.600000000000158 | -1.533 | -1.375 | -1.17 |
| -4.590000000000158 | -1.531 | -1.373 | -1.167 |
| -4.580000000000158 | -1.53 | -1.372 | -1.165 |
| -4.570000000000158 | -1.528 | -1.37 | -1.162 |
| -4.560000000000159 | -1.527 | -1.368 | -1.16 |
| -4.550000000000159 | -1.525 | -1.366 | -1.157 |
| -4.54000000000016 | -1.524 | -1.364 | -1.155 |
| -4.53000000000016 | -1.523 | -1.363 | -1.152 |
| -4.520000000000159 | -1.521 | -1.361 | -1.15 |
| -4.51000000000016 | -1.52 | -1.359 | -1.147 |
| -4.50000000000016 | -1.518 | -1.357 | -1.145 |
| -4.49000000000016 | -1.517 | -1.355 | -1.142 |
| -4.48000000000016 | -1.515 | -1.354 | -1.14 |
| -4.47000000000016 | -1.514 | -1.352 | -1.137 |
| -4.46000000000016 | -1.512 | -1.35 | -1.134 |
| -4.45000000000016 | -1.511 | -1.348 | -1.132 |
| -4.44000000000016 | -1.51 | -1.346 | -1.129 |
| -4.43000000000016 | -1.508 | -1.344 | -1.127 |
| -4.420000000000161 | -1.507 | -1.343 | -1.124 |
| -4.410000000000161 | -1.505 | -1.341 | -1.121 |
| -4.400000000000161 | -1.504 | -1.339 | -1.119 |
| -4.390000000000162 | -1.502 | -1.337 | -1.116 |
| -4.380000000000162 | -1.501 | -1.335 | -1.113 |
| -4.370000000000162 | -1.499 | -1.333 | -1.111 |
| -4.360000000000163 | -1.498 | -1.331 | -1.108 |
| -4.350000000000163 | -1.496 | -1.33 | -1.105 |
| -4.340000000000163 | -1.495 | -1.328 | -1.102 |
| -4.330000000000163 | -1.493 | -1.326 | -1.1 |
| -4.320000000000164 | -1.492 | -1.324 | -1.097 |
| -4.310000000000164 | -1.49 | -1.322 | -1.094 |
| -4.300000000000164 | -1.489 | -1.32 | -1.091 |
| -4.290000000000164 | -1.487 | -1.318 | -1.089 |
| -4.280000000000164 | -1.486 | -1.316 | -1.086 |
| -4.270000000000164 | -1.484 | -1.314 | -1.083 |
| -4.260000000000164 | -1.483 | -1.312 | -1.08 |
| -4.250000000000165 | -1.481 | -1.31 | -1.077 |
| -4.240000000000165 | -1.48 | -1.308 | -1.074 |
| -4.230000000000165 | -1.478 | -1.306 | -1.071 |
| -4.220000000000165 | -1.477 | -1.305 | -1.069 |
| -4.210000000000166 | -1.475 | -1.303 | -1.066 |
| -4.200000000000166 | -1.474 | -1.301 | -1.063 |
| -4.190000000000166 | -1.472 | -1.299 | -1.06 |
| -4.180000000000166 | -1.471 | -1.297 | -1.057 |
| -4.170000000000166 | -1.469 | -1.295 | -1.054 |
| -4.160000000000167 | -1.467 | -1.293 | -1.051 |
| -4.150000000000167 | -1.466 | -1.291 | -1.048 |
| -4.140000000000167 | -1.464 | -1.289 | -1.045 |
| -4.130000000000167 | -1.463 | -1.287 | -1.042 |
| -4.120000000000168 | -1.461 | -1.285 | -1.038 |
| -4.110000000000168 | -1.46 | -1.283 | -1.035 |
| -4.100000000000168 | -1.458 | -1.281 | -1.032 |
| -4.090000000000168 | -1.457 | -1.279 | -1.029 |
| -4.080000000000168 | -1.455 | -1.277 | -1.026 |
| -4.07000000000017 | -1.453 | -1.274 | -1.023 |
| -4.06000000000017 | -1.452 | -1.272 | -1.02 |
| -4.05000000000017 | -1.45 | -1.27 | -1.016 |
| -4.04000000000017 | -1.449 | -1.268 | -1.013 |
| -4.03000000000017 | -1.447 | -1.266 | -1.01 |
| -4.02000000000017 | -1.445 | -1.264 | -1.007 |
| -4.01000000000017 | -1.444 | -1.262 | -1.003 |
| -4.00000000000017 | -1.442 | -1.26 | -1 |
| -3.990000000000171 | -1.441 | -1.258 | -0.997 |
| -3.980000000000171 | -1.439 | -1.256 | -0.993 |
| -3.970000000000171 | -1.437 | -1.254 | -0.99 |
| -3.960000000000171 | -1.436 | -1.251 | -0.986 |
| -3.950000000000172 | -1.434 | -1.249 | -0.983 |
| -3.940000000000172 | -1.433 | -1.247 | -0.98 |
| -3.930000000000172 | -1.431 | -1.245 | -0.976 |
| -3.920000000000172 | -1.429 | -1.243 | -0.973 |
| -3.910000000000172 | -1.428 | -1.241 | -0.969 |
| -3.900000000000173 | -1.426 | -1.239 | -0.965 |
| -3.890000000000173 | -1.424 | -1.236 | -0.962 |
| -3.880000000000173 | -1.423 | -1.234 | -0.958 |
| -3.870000000000173 | -1.421 | -1.232 | -0.955 |
| -3.860000000000173 | -1.419 | -1.23 | -0.951 |
| -3.850000000000174 | -1.418 | -1.228 | -0.947 |
| -3.840000000000174 | -1.416 | -1.225 | -0.944 |
| -3.830000000000174 | -1.414 | -1.223 | -0.94 |
| -3.820000000000174 | -1.413 | -1.221 | -0.936 |
| -3.810000000000175 | -1.411 | -1.219 | -0.932 |
| -3.800000000000175 | -1.409 | -1.216 | -0.928 |
| -3.790000000000175 | -1.408 | -1.214 | -0.924 |
| -3.780000000000175 | -1.406 | -1.212 | -0.921 |
| -3.770000000000175 | -1.404 | -1.21 | -0.917 |
| -3.760000000000176 | -1.403 | -1.207 | -0.913 |
| -3.750000000000176 | -1.401 | -1.205 | -0.909 |
| -3.740000000000176 | -1.399 | -1.203 | -0.905 |
| -3.730000000000176 | -1.398 | -1.2 | -0.9 |
| -3.720000000000176 | -1.396 | -1.198 | -0.896 |
| -3.710000000000177 | -1.394 | -1.196 | -0.892 |
| -3.700000000000177 | -1.392 | -1.193 | -0.888 |
| -3.690000000000177 | -1.391 | -1.191 | -0.884 |
| -3.680000000000177 | -1.389 | -1.189 | -0.879 |
| -3.670000000000177 | -1.387 | -1.186 | -0.875 |
| -3.660000000000178 | -1.386 | -1.184 | -0.871 |
| -3.650000000000178 | -1.384 | -1.182 | -0.866 |
| -3.640000000000178 | -1.382 | -1.179 | -0.862 |
| -3.630000000000178 | -1.38 | -1.177 | -0.857 |
| -3.620000000000179 | -1.379 | -1.174 | -0.853 |
| -3.610000000000179 | -1.377 | -1.172 | -0.848 |
| -3.600000000000179 | -1.375 | -1.17 | -0.843 |
| -3.590000000000179 | -1.373 | -1.167 | -0.839 |
| -3.580000000000179 | -1.372 | -1.165 | -0.834 |
| -3.57000000000018 | -1.37 | -1.162 | -0.829 |
| -3.56000000000018 | -1.368 | -1.16 | -0.824 |
| -3.55000000000018 | -1.366 | -1.157 | -0.819 |
| -3.54000000000018 | -1.364 | -1.155 | -0.814 |
| -3.530000000000181 | -1.363 | -1.152 | -0.809 |
| -3.520000000000181 | -1.361 | -1.15 | -0.804 |
| -3.510000000000181 | -1.359 | -1.147 | -0.799 |
| -3.500000000000181 | -1.357 | -1.145 | -0.794 |
| -3.490000000000181 | -1.355 | -1.142 | -0.788 |
| -3.480000000000182 | -1.354 | -1.14 | -0.783 |
| -3.470000000000182 | -1.352 | -1.137 | -0.777 |
| -3.460000000000182 | -1.35 | -1.134 | -0.772 |
| -3.450000000000182 | -1.348 | -1.132 | -0.766 |
| -3.440000000000182 | -1.346 | -1.129 | -0.761 |
| -3.430000000000183 | -1.344 | -1.127 | -0.755 |
| -3.420000000000183 | -1.343 | -1.124 | -0.749 |
| -3.410000000000183 | -1.341 | -1.121 | -0.743 |
| -3.400000000000183 | -1.339 | -1.119 | -0.737 |
| -3.390000000000183 | -1.337 | -1.116 | -0.731 |
| -3.380000000000184 | -1.335 | -1.113 | -0.724 |
| -3.370000000000184 | -1.333 | -1.111 | -0.718 |
| -3.360000000000184 | -1.331 | -1.108 | -0.711 |
| -3.350000000000184 | -1.33 | -1.105 | -0.705 |
| -3.340000000000185 | -1.328 | -1.102 | -0.698 |
| -3.330000000000185 | -1.326 | -1.1 | -0.691 |
| -3.320000000000185 | -1.324 | -1.097 | -0.684 |
| -3.310000000000185 | -1.322 | -1.094 | -0.677 |
| -3.300000000000185 | -1.32 | -1.091 | -0.669 |
| -3.290000000000186 | -1.318 | -1.089 | -0.662 |
| -3.280000000000186 | -1.316 | -1.086 | -0.654 |
| -3.270000000000186 | -1.314 | -1.083 | -0.646 |
| -3.260000000000186 | -1.312 | -1.08 | -0.638 |
| -3.250000000000186 | -1.31 | -1.077 | -0.63 |
| -3.240000000000187 | -1.308 | -1.074 | -0.621 |
| -3.230000000000187 | -1.306 | -1.071 | -0.613 |
| -3.220000000000187 | -1.305 | -1.069 | -0.604 |
| -3.210000000000187 | -1.303 | -1.066 | -0.594 |
| -3.200000000000188 | -1.301 | -1.063 | -0.585 |
| -3.190000000000188 | -1.299 | -1.06 | -0.575 |
| -3.180000000000188 | -1.297 | -1.057 | -0.565 |
| -3.170000000000188 | -1.295 | -1.054 | -0.554 |
| -3.160000000000188 | -1.293 | -1.051 | -0.543 |
| -3.150000000000189 | -1.291 | -1.048 | -0.531 |
| -3.140000000000189 | -1.289 | -1.045 | -0.519 |
| -3.130000000000189 | -1.287 | -1.042 | -0.507 |
| -3.120000000000189 | -1.285 | -1.038 | -0.493 |
| -3.110000000000189 | -1.283 | -1.035 | -0.479 |
| -3.10000000000019 | -1.281 | -1.032 | -0.464 |
| -3.09000000000019 | -1.279 | -1.029 | -0.448 |
| -3.08000000000019 | -1.277 | -1.026 | -0.431 |
| -3.07000000000019 | -1.274 | -1.023 | -0.412 |
| -3.060000000000191 | -1.272 | -1.02 | -0.391 |
| -3.050000000000191 | -1.27 | -1.016 | -0.368 |
| -3.040000000000191 | -1.268 | -1.013 | -0.342 |
| -3.030000000000191 | -1.266 | -1.01 | -0.311 |
| -3.020000000000191 | -1.264 | -1.007 | -0.271 |
| -3.010000000000192 | -1.262 | -1.003 | -0.215 |
| -3.000000000000192 | -1.26 | -1 | 0 |
| -2.990000000000192 | -1.258 | -0.997 | 0.215 |
| -2.980000000000192 | -1.256 | -0.993 | 0.271 |
| -2.970000000000192 | -1.254 | -0.99 | 0.311 |
| -2.960000000000193 | -1.251 | -0.986 | 0.342 |
| -2.950000000000193 | -1.249 | -0.983 | 0.368 |
| -2.940000000000193 | -1.247 | -0.98 | 0.391 |
| -2.930000000000193 | -1.245 | -0.976 | 0.412 |
| -2.920000000000194 | -1.243 | -0.973 | 0.431 |
| -2.910000000000194 | -1.241 | -0.969 | 0.448 |
| -2.900000000000194 | -1.239 | -0.965 | 0.464 |
| -2.890000000000194 | -1.236 | -0.962 | 0.479 |
| -2.880000000000194 | -1.234 | -0.958 | 0.493 |
| -2.870000000000195 | -1.232 | -0.955 | 0.507 |
| -2.860000000000195 | -1.23 | -0.951 | 0.519 |
| -2.850000000000195 | -1.228 | -0.947 | 0.531 |
| -2.840000000000195 | -1.225 | -0.944 | 0.543 |
| -2.830000000000195 | -1.223 | -0.94 | 0.554 |
| -2.820000000000196 | -1.221 | -0.936 | 0.565 |
| -2.810000000000196 | -1.219 | -0.932 | 0.575 |
| -2.800000000000196 | -1.216 | -0.928 | 0.585 |
| -2.790000000000196 | -1.214 | -0.924 | 0.594 |
| -2.780000000000196 | -1.212 | -0.921 | 0.604 |
| -2.770000000000197 | -1.21 | -0.917 | 0.613 |
| -2.760000000000197 | -1.207 | -0.913 | 0.621 |
| -2.750000000000197 | -1.205 | -0.909 | 0.63 |
| -2.740000000000197 | -1.203 | -0.905 | 0.638 |
| -2.730000000000198 | -1.2 | -0.9 | 0.646 |
| -2.720000000000198 | -1.198 | -0.896 | 0.654 |
| -2.710000000000198 | -1.196 | -0.892 | 0.662 |
| -2.700000000000198 | -1.193 | -0.888 | 0.669 |
| -2.690000000000198 | -1.191 | -0.884 | 0.677 |
| -2.680000000000199 | -1.189 | -0.879 | 0.684 |
| -2.670000000000199 | -1.186 | -0.875 | 0.691 |
| -2.660000000000199 | -1.184 | -0.871 | 0.698 |
| -2.650000000000199 | -1.182 | -0.866 | 0.705 |
| -2.640000000000199 | -1.179 | -0.862 | 0.711 |
| -2.6300000000002 | -1.177 | -0.857 | 0.718 |
| -2.6200000000002 | -1.174 | -0.853 | 0.724 |
| -2.6100000000002 | -1.172 | -0.848 | 0.731 |
| -2.6000000000002 | -1.17 | -0.843 | 0.737 |
| -2.590000000000201 | -1.167 | -0.839 | 0.743 |
| -2.580000000000201 | -1.165 | -0.834 | 0.749 |
| -2.570000000000201 | -1.162 | -0.829 | 0.755 |
| -2.560000000000201 | -1.16 | -0.824 | 0.761 |
| -2.550000000000201 | -1.157 | -0.819 | 0.766 |
| -2.540000000000202 | -1.155 | -0.814 | 0.772 |
| -2.530000000000202 | -1.152 | -0.809 | 0.777 |
| -2.520000000000202 | -1.15 | -0.804 | 0.783 |
| -2.510000000000202 | -1.147 | -0.799 | 0.788 |
| -2.500000000000203 | -1.145 | -0.794 | 0.794 |
| -2.490000000000203 | -1.142 | -0.788 | 0.799 |
| -2.480000000000203 | -1.14 | -0.783 | 0.804 |
| -2.470000000000203 | -1.137 | -0.777 | 0.809 |
| -2.460000000000203 | -1.134 | -0.772 | 0.814 |
| -2.450000000000204 | -1.132 | -0.766 | 0.819 |
| -2.440000000000204 | -1.129 | -0.761 | 0.824 |
| -2.430000000000204 | -1.127 | -0.755 | 0.829 |
| -2.420000000000204 | -1.124 | -0.749 | 0.834 |
| -2.410000000000204 | -1.121 | -0.743 | 0.839 |
| -2.400000000000205 | -1.119 | -0.737 | 0.843 |
| -2.390000000000205 | -1.116 | -0.731 | 0.848 |
| -2.380000000000205 | -1.113 | -0.724 | 0.853 |
| -2.370000000000205 | -1.111 | -0.718 | 0.857 |
| -2.360000000000205 | -1.108 | -0.711 | 0.862 |
| -2.350000000000206 | -1.105 | -0.705 | 0.866 |
| -2.340000000000206 | -1.102 | -0.698 | 0.871 |
| -2.330000000000206 | -1.1 | -0.691 | 0.875 |
| -2.320000000000206 | -1.097 | -0.684 | 0.879 |
| -2.310000000000207 | -1.094 | -0.677 | 0.884 |
| -2.300000000000207 | -1.091 | -0.669 | 0.888 |
| -2.290000000000207 | -1.089 | -0.662 | 0.892 |
| -2.280000000000207 | -1.086 | -0.654 | 0.896 |
| -2.270000000000207 | -1.083 | -0.646 | 0.9 |
| -2.260000000000208 | -1.08 | -0.638 | 0.905 |
| -2.250000000000208 | -1.077 | -0.63 | 0.909 |
| -2.240000000000208 | -1.074 | -0.621 | 0.913 |
| -2.230000000000208 | -1.071 | -0.613 | 0.917 |
| -2.220000000000208 | -1.069 | -0.604 | 0.921 |
| -2.210000000000209 | -1.066 | -0.594 | 0.924 |
| -2.200000000000209 | -1.063 | -0.585 | 0.928 |
| -2.190000000000209 | -1.06 | -0.575 | 0.932 |
| -2.180000000000209 | -1.057 | -0.565 | 0.936 |
| -2.17000000000021 | -1.054 | -0.554 | 0.94 |
| -2.16000000000021 | -1.051 | -0.543 | 0.944 |
| -2.15000000000021 | -1.048 | -0.531 | 0.947 |
| -2.14000000000021 | -1.045 | -0.519 | 0.951 |
| -2.13000000000021 | -1.042 | -0.507 | 0.955 |
| -2.120000000000211 | -1.038 | -0.493 | 0.958 |
| -2.110000000000211 | -1.035 | -0.479 | 0.962 |
| -2.100000000000211 | -1.032 | -0.464 | 0.965 |
| -2.090000000000211 | -1.029 | -0.448 | 0.969 |
| -2.080000000000211 | -1.026 | -0.431 | 0.973 |
| -2.070000000000212 | -1.023 | -0.412 | 0.976 |
| -2.060000000000212 | -1.02 | -0.391 | 0.98 |
| -2.050000000000212 | -1.016 | -0.368 | 0.983 |
| -2.040000000000212 | -1.013 | -0.342 | 0.986 |
| -2.030000000000213 | -1.01 | -0.311 | 0.99 |
| -2.020000000000213 | -1.007 | -0.271 | 0.993 |
| -2.010000000000213 | -1.003 | -0.215 | 0.997 |
| -2.000000000000213 | -1 | 0 | 1 |
| -1.990000000000213 | -0.997 | 0.215 | 1.003 |
| -1.980000000000213 | -0.993 | 0.271 | 1.007 |
| -1.970000000000213 | -0.99 | 0.311 | 1.01 |
| -1.960000000000213 | -0.986 | 0.342 | 1.013 |
| -1.950000000000213 | -0.983 | 0.368 | 1.016 |
| -1.940000000000213 | -0.98 | 0.391 | 1.02 |
| -1.930000000000213 | -0.976 | 0.412 | 1.023 |
| -1.920000000000213 | -0.973 | 0.431 | 1.026 |
| -1.910000000000213 | -0.969 | 0.448 | 1.029 |
| -1.900000000000213 | -0.965 | 0.464 | 1.032 |
| -1.890000000000213 | -0.962 | 0.479 | 1.035 |
| -1.880000000000213 | -0.958 | 0.493 | 1.038 |
| -1.870000000000213 | -0.955 | 0.507 | 1.042 |
| -1.860000000000213 | -0.951 | 0.519 | 1.045 |
| -1.850000000000213 | -0.947 | 0.531 | 1.048 |
| -1.840000000000213 | -0.944 | 0.543 | 1.051 |
| -1.830000000000213 | -0.94 | 0.554 | 1.054 |
| -1.820000000000213 | -0.936 | 0.565 | 1.057 |
| -1.810000000000213 | -0.932 | 0.575 | 1.06 |
| -1.800000000000213 | -0.928 | 0.585 | 1.063 |
| -1.790000000000213 | -0.924 | 0.594 | 1.066 |
| -1.780000000000213 | -0.921 | 0.604 | 1.069 |
| -1.770000000000213 | -0.917 | 0.613 | 1.071 |
| -1.760000000000213 | -0.913 | 0.621 | 1.074 |
| -1.750000000000213 | -0.909 | 0.63 | 1.077 |
| -1.740000000000213 | -0.905 | 0.638 | 1.08 |
| -1.730000000000213 | -0.9 | 0.646 | 1.083 |
| -1.720000000000213 | -0.896 | 0.654 | 1.086 |
| -1.710000000000213 | -0.892 | 0.662 | 1.089 |
| -1.700000000000213 | -0.888 | 0.669 | 1.091 |
| -1.690000000000213 | -0.884 | 0.677 | 1.094 |
| -1.680000000000213 | -0.879 | 0.684 | 1.097 |
| -1.670000000000213 | -0.875 | 0.691 | 1.1 |
| -1.660000000000213 | -0.871 | 0.698 | 1.102 |
| -1.650000000000213 | -0.866 | 0.705 | 1.105 |
| -1.640000000000213 | -0.862 | 0.711 | 1.108 |
| -1.630000000000213 | -0.857 | 0.718 | 1.111 |
| -1.620000000000213 | -0.853 | 0.724 | 1.113 |
| -1.610000000000213 | -0.848 | 0.731 | 1.116 |
| -1.600000000000213 | -0.843 | 0.737 | 1.119 |
| -1.590000000000213 | -0.839 | 0.743 | 1.121 |
| -1.580000000000213 | -0.834 | 0.749 | 1.124 |
| -1.570000000000213 | -0.829 | 0.755 | 1.127 |
| -1.560000000000213 | -0.824 | 0.761 | 1.129 |
| -1.550000000000213 | -0.819 | 0.766 | 1.132 |
| -1.540000000000213 | -0.814 | 0.772 | 1.134 |
| -1.530000000000213 | -0.809 | 0.777 | 1.137 |
| -1.520000000000213 | -0.804 | 0.783 | 1.14 |
| -1.510000000000213 | -0.799 | 0.788 | 1.142 |
| -1.500000000000213 | -0.794 | 0.794 | 1.145 |
| -1.490000000000213 | -0.788 | 0.799 | 1.147 |
| -1.480000000000213 | -0.783 | 0.804 | 1.15 |
| -1.470000000000213 | -0.777 | 0.809 | 1.152 |
| -1.460000000000213 | -0.772 | 0.814 | 1.155 |
| -1.450000000000213 | -0.766 | 0.819 | 1.157 |
| -1.440000000000213 | -0.761 | 0.824 | 1.16 |
| -1.430000000000213 | -0.755 | 0.829 | 1.162 |
| -1.420000000000213 | -0.749 | 0.834 | 1.165 |
| -1.410000000000213 | -0.743 | 0.839 | 1.167 |
| -1.400000000000213 | -0.737 | 0.843 | 1.17 |
| -1.390000000000213 | -0.731 | 0.848 | 1.172 |
| -1.380000000000213 | -0.724 | 0.853 | 1.174 |
| -1.370000000000213 | -0.718 | 0.857 | 1.177 |
| -1.360000000000213 | -0.711 | 0.862 | 1.179 |
| -1.350000000000213 | -0.705 | 0.866 | 1.182 |
| -1.340000000000213 | -0.698 | 0.871 | 1.184 |
| -1.330000000000213 | -0.691 | 0.875 | 1.186 |
| -1.320000000000213 | -0.684 | 0.879 | 1.189 |
| -1.310000000000213 | -0.677 | 0.884 | 1.191 |
| -1.300000000000212 | -0.669 | 0.888 | 1.193 |
| -1.290000000000212 | -0.662 | 0.892 | 1.196 |
| -1.280000000000212 | -0.654 | 0.896 | 1.198 |
| -1.270000000000212 | -0.646 | 0.9 | 1.2 |
| -1.260000000000212 | -0.638 | 0.905 | 1.203 |
| -1.250000000000212 | -0.63 | 0.909 | 1.205 |
| -1.240000000000212 | -0.621 | 0.913 | 1.207 |
| -1.230000000000212 | -0.613 | 0.917 | 1.21 |
| -1.220000000000212 | -0.604 | 0.921 | 1.212 |
| -1.210000000000212 | -0.594 | 0.924 | 1.214 |
| -1.200000000000212 | -0.585 | 0.928 | 1.216 |
| -1.190000000000212 | -0.575 | 0.932 | 1.219 |
| -1.180000000000212 | -0.565 | 0.936 | 1.221 |
| -1.170000000000212 | -0.554 | 0.94 | 1.223 |
| -1.160000000000212 | -0.543 | 0.944 | 1.225 |
| -1.150000000000212 | -0.531 | 0.947 | 1.228 |
| -1.140000000000212 | -0.519 | 0.951 | 1.23 |
| -1.130000000000212 | -0.507 | 0.955 | 1.232 |
| -1.120000000000212 | -0.493 | 0.958 | 1.234 |
| -1.110000000000212 | -0.479 | 0.962 | 1.236 |
| -1.100000000000212 | -0.464 | 0.965 | 1.239 |
| -1.090000000000212 | -0.448 | 0.969 | 1.241 |
| -1.080000000000212 | -0.431 | 0.973 | 1.243 |
| -1.070000000000212 | -0.412 | 0.976 | 1.245 |
| -1.060000000000212 | -0.391 | 0.98 | 1.247 |
| -1.050000000000212 | -0.368 | 0.983 | 1.249 |
| -1.040000000000212 | -0.342 | 0.986 | 1.251 |
| -1.030000000000212 | -0.311 | 0.99 | 1.254 |
| -1.020000000000212 | -0.271 | 0.993 | 1.256 |
| -1.010000000000212 | -0.215 | 0.997 | 1.258 |
| -1.000000000000212 | 0 | 1 | 1.26 |
| -0.990000000000212 | 0.215 | 1.003 | 1.262 |
| -0.980000000000212 | 0.271 | 1.007 | 1.264 |
| -0.970000000000212 | 0.311 | 1.01 | 1.266 |
| -0.960000000000212 | 0.342 | 1.013 | 1.268 |
| -0.950000000000212 | 0.368 | 1.016 | 1.27 |
| -0.940000000000212 | 0.391 | 1.02 | 1.272 |
| -0.930000000000212 | 0.412 | 1.023 | 1.274 |
| -0.920000000000212 | 0.431 | 1.026 | 1.277 |
| -0.910000000000212 | 0.448 | 1.029 | 1.279 |
| -0.900000000000212 | 0.464 | 1.032 | 1.281 |
| -0.890000000000212 | 0.479 | 1.035 | 1.283 |
| -0.880000000000212 | 0.493 | 1.038 | 1.285 |
| -0.870000000000212 | 0.507 | 1.042 | 1.287 |
| -0.860000000000212 | 0.519 | 1.045 | 1.289 |
| -0.850000000000212 | 0.531 | 1.048 | 1.291 |
| -0.840000000000212 | 0.543 | 1.051 | 1.293 |
| -0.830000000000212 | 0.554 | 1.054 | 1.295 |
| -0.820000000000212 | 0.565 | 1.057 | 1.297 |
| -0.810000000000212 | 0.575 | 1.06 | 1.299 |
| -0.800000000000212 | 0.585 | 1.063 | 1.301 |
| -0.790000000000212 | 0.594 | 1.066 | 1.303 |
| -0.780000000000212 | 0.604 | 1.069 | 1.305 |
| -0.770000000000212 | 0.613 | 1.071 | 1.306 |
| -0.760000000000212 | 0.621 | 1.074 | 1.308 |
| -0.750000000000212 | 0.63 | 1.077 | 1.31 |
| -0.740000000000212 | 0.638 | 1.08 | 1.312 |
| -0.730000000000212 | 0.646 | 1.083 | 1.314 |
| -0.720000000000212 | 0.654 | 1.086 | 1.316 |
| -0.710000000000212 | 0.662 | 1.089 | 1.318 |
| -0.700000000000212 | 0.669 | 1.091 | 1.32 |
| -0.690000000000212 | 0.677 | 1.094 | 1.322 |
| -0.680000000000212 | 0.684 | 1.097 | 1.324 |
| -0.670000000000212 | 0.691 | 1.1 | 1.326 |
| -0.660000000000212 | 0.698 | 1.102 | 1.328 |
| -0.650000000000212 | 0.705 | 1.105 | 1.33 |
| -0.640000000000212 | 0.711 | 1.108 | 1.331 |
| -0.630000000000212 | 0.718 | 1.111 | 1.333 |
| -0.620000000000212 | 0.724 | 1.113 | 1.335 |
| -0.610000000000212 | 0.731 | 1.116 | 1.337 |
| -0.600000000000212 | 0.737 | 1.119 | 1.339 |
| -0.590000000000212 | 0.743 | 1.121 | 1.341 |
| -0.580000000000212 | 0.749 | 1.124 | 1.343 |
| -0.570000000000212 | 0.755 | 1.127 | 1.344 |
| -0.560000000000212 | 0.761 | 1.129 | 1.346 |
| -0.550000000000212 | 0.766 | 1.132 | 1.348 |
| -0.540000000000212 | 0.772 | 1.134 | 1.35 |
| -0.530000000000212 | 0.777 | 1.137 | 1.352 |
| -0.520000000000212 | 0.783 | 1.14 | 1.354 |
| -0.510000000000212 | 0.788 | 1.142 | 1.355 |
| -0.500000000000212 | 0.794 | 1.145 | 1.357 |
| -0.490000000000212 | 0.799 | 1.147 | 1.359 |
| -0.480000000000212 | 0.804 | 1.15 | 1.361 |
| -0.470000000000212 | 0.809 | 1.152 | 1.363 |
| -0.460000000000212 | 0.814 | 1.155 | 1.364 |
| -0.450000000000212 | 0.819 | 1.157 | 1.366 |
| -0.440000000000212 | 0.824 | 1.16 | 1.368 |
| -0.430000000000212 | 0.829 | 1.162 | 1.37 |
| -0.420000000000212 | 0.834 | 1.165 | 1.372 |
| -0.410000000000212 | 0.839 | 1.167 | 1.373 |
| -0.400000000000212 | 0.843 | 1.17 | 1.375 |
| -0.390000000000212 | 0.848 | 1.172 | 1.377 |
| -0.380000000000212 | 0.853 | 1.174 | 1.379 |
| -0.370000000000212 | 0.857 | 1.177 | 1.38 |
| -0.360000000000212 | 0.862 | 1.179 | 1.382 |
| -0.350000000000212 | 0.866 | 1.182 | 1.384 |
| -0.340000000000212 | 0.871 | 1.184 | 1.386 |
| -0.330000000000212 | 0.875 | 1.186 | 1.387 |
| -0.320000000000212 | 0.879 | 1.189 | 1.389 |
| -0.310000000000212 | 0.884 | 1.191 | 1.391 |
| -0.300000000000212 | 0.888 | 1.193 | 1.392 |
| -0.290000000000212 | 0.892 | 1.196 | 1.394 |
| -0.280000000000212 | 0.896 | 1.198 | 1.396 |
| -0.270000000000212 | 0.9 | 1.2 | 1.398 |
| -0.260000000000212 | 0.905 | 1.203 | 1.399 |
| -0.250000000000212 | 0.909 | 1.205 | 1.401 |
| -0.240000000000212 | 0.913 | 1.207 | 1.403 |
| -0.230000000000212 | 0.917 | 1.21 | 1.404 |
| -0.220000000000212 | 0.921 | 1.212 | 1.406 |
| -0.210000000000212 | 0.924 | 1.214 | 1.408 |
| -0.200000000000212 | 0.928 | 1.216 | 1.409 |
| -0.190000000000212 | 0.932 | 1.219 | 1.411 |
| -0.180000000000212 | 0.936 | 1.221 | 1.413 |
| -0.170000000000212 | 0.94 | 1.223 | 1.414 |
| -0.160000000000212 | 0.944 | 1.225 | 1.416 |
| -0.150000000000212 | 0.947 | 1.228 | 1.418 |
| -0.140000000000211 | 0.951 | 1.23 | 1.419 |
| -0.130000000000211 | 0.955 | 1.232 | 1.421 |
| -0.120000000000211 | 0.958 | 1.234 | 1.423 |
| -0.110000000000212 | 0.962 | 1.236 | 1.424 |
| -0.100000000000212 | 0.965 | 1.239 | 1.426 |
| -0.0900000000002115 | 0.969 | 1.241 | 1.428 |
| -0.0800000000002115 | 0.973 | 1.243 | 1.429 |
| -0.0700000000002115 | 0.976 | 1.245 | 1.431 |
| -0.0600000000002115 | 0.98 | 1.247 | 1.433 |
| -0.0500000000002115 | 0.983 | 1.249 | 1.434 |
| -0.0400000000002115 | 0.986 | 1.251 | 1.436 |
| -0.0300000000002115 | 0.99 | 1.254 | 1.437 |
| -0.0200000000002115 | 0.993 | 1.256 | 1.439 |
| -0.0100000000002115 | 0.997 | 1.258 | 1.441 |
| -2.11521772319756e-13 | 1 | 1.26 | 1.442 |
| 0.00999999999978848 | 1.003 | 1.262 | 1.444 |
| 0.0199999999997885 | 1.007 | 1.264 | 1.445 |
| 0.0299999999997885 | 1.01 | 1.266 | 1.447 |
| 0.0399999999997885 | 1.013 | 1.268 | 1.449 |
| 0.0499999999997885 | 1.016 | 1.27 | 1.45 |
| 0.0599999999997885 | 1.02 | 1.272 | 1.452 |
| 0.0699999999997885 | 1.023 | 1.274 | 1.453 |
| 0.0799999999997885 | 1.026 | 1.277 | 1.455 |
| 0.0899999999997885 | 1.029 | 1.279 | 1.457 |
| 0.0999999999997884 | 1.032 | 1.281 | 1.458 |
| 0.109999999999788 | 1.035 | 1.283 | 1.46 |
| 0.119999999999788 | 1.038 | 1.285 | 1.461 |
| 0.129999999999788 | 1.042 | 1.287 | 1.463 |
| 0.139999999999788 | 1.045 | 1.289 | 1.464 |
| 0.149999999999788 | 1.048 | 1.291 | 1.466 |
| 0.159999999999788 | 1.051 | 1.293 | 1.467 |
| 0.169999999999788 | 1.054 | 1.295 | 1.469 |
| 0.179999999999788 | 1.057 | 1.297 | 1.471 |
| 0.189999999999788 | 1.06 | 1.299 | 1.472 |
| 0.199999999999788 | 1.063 | 1.301 | 1.474 |
| 0.209999999999789 | 1.066 | 1.303 | 1.475 |
| 0.219999999999789 | 1.069 | 1.305 | 1.477 |
| 0.229999999999789 | 1.071 | 1.306 | 1.478 |
| 0.239999999999789 | 1.074 | 1.308 | 1.48 |
| 0.249999999999789 | 1.077 | 1.31 | 1.481 |
| 0.259999999999789 | 1.08 | 1.312 | 1.483 |
| 0.269999999999789 | 1.083 | 1.314 | 1.484 |
| 0.279999999999789 | 1.086 | 1.316 | 1.486 |
| 0.289999999999789 | 1.089 | 1.318 | 1.487 |
| 0.299999999999789 | 1.091 | 1.32 | 1.489 |
| 0.309999999999789 | 1.094 | 1.322 | 1.49 |
| 0.319999999999789 | 1.097 | 1.324 | 1.492 |
| 0.329999999999789 | 1.1 | 1.326 | 1.493 |
| 0.339999999999789 | 1.102 | 1.328 | 1.495 |
| 0.349999999999789 | 1.105 | 1.33 | 1.496 |
| 0.359999999999789 | 1.108 | 1.331 | 1.498 |
| 0.369999999999789 | 1.111 | 1.333 | 1.499 |
| 0.379999999999789 | 1.113 | 1.335 | 1.501 |
| 0.389999999999789 | 1.116 | 1.337 | 1.502 |
| 0.399999999999789 | 1.119 | 1.339 | 1.504 |
| 0.409999999999789 | 1.121 | 1.341 | 1.505 |
| 0.419999999999789 | 1.124 | 1.343 | 1.507 |
| 0.429999999999789 | 1.127 | 1.344 | 1.508 |
| 0.439999999999789 | 1.129 | 1.346 | 1.51 |
| 0.449999999999789 | 1.132 | 1.348 | 1.511 |
| 0.459999999999789 | 1.134 | 1.35 | 1.512 |
| 0.469999999999789 | 1.137 | 1.352 | 1.514 |
| 0.479999999999789 | 1.14 | 1.354 | 1.515 |
| 0.489999999999789 | 1.142 | 1.355 | 1.517 |
| 0.499999999999789 | 1.145 | 1.357 | 1.518 |
| 0.509999999999789 | 1.147 | 1.359 | 1.52 |
| 0.519999999999789 | 1.15 | 1.361 | 1.521 |
| 0.529999999999789 | 1.152 | 1.363 | 1.523 |
| 0.539999999999789 | 1.155 | 1.364 | 1.524 |
| 0.549999999999789 | 1.157 | 1.366 | 1.525 |
| 0.559999999999789 | 1.16 | 1.368 | 1.527 |
| 0.569999999999789 | 1.162 | 1.37 | 1.528 |
| 0.579999999999789 | 1.165 | 1.372 | 1.53 |
| 0.589999999999789 | 1.167 | 1.373 | 1.531 |
| 0.599999999999789 | 1.17 | 1.375 | 1.533 |
| 0.609999999999789 | 1.172 | 1.377 | 1.534 |
| 0.619999999999789 | 1.174 | 1.379 | 1.535 |
| 0.629999999999789 | 1.177 | 1.38 | 1.537 |
| 0.639999999999789 | 1.179 | 1.382 | 1.538 |
| 0.649999999999789 | 1.182 | 1.384 | 1.54 |
| 0.659999999999789 | 1.184 | 1.386 | 1.541 |
| 0.669999999999789 | 1.186 | 1.387 | 1.542 |
| 0.679999999999789 | 1.189 | 1.389 | 1.544 |
| 0.689999999999789 | 1.191 | 1.391 | 1.545 |
| 0.699999999999789 | 1.193 | 1.392 | 1.547 |
| 0.709999999999789 | 1.196 | 1.394 | 1.548 |
| 0.719999999999789 | 1.198 | 1.396 | 1.549 |
| 0.729999999999789 | 1.2 | 1.398 | 1.551 |
| 0.739999999999789 | 1.203 | 1.399 | 1.552 |
| 0.749999999999789 | 1.205 | 1.401 | 1.554 |
| 0.759999999999789 | 1.207 | 1.403 | 1.555 |
| 0.769999999999789 | 1.21 | 1.404 | 1.556 |
| 0.779999999999789 | 1.212 | 1.406 | 1.558 |
| 0.789999999999789 | 1.214 | 1.408 | 1.559 |
| 0.799999999999789 | 1.216 | 1.409 | 1.56 |
| 0.809999999999789 | 1.219 | 1.411 | 1.562 |
| 0.819999999999789 | 1.221 | 1.413 | 1.563 |
| 0.829999999999789 | 1.223 | 1.414 | 1.565 |
| 0.839999999999789 | 1.225 | 1.416 | 1.566 |
| 0.849999999999789 | 1.228 | 1.418 | 1.567 |
| 0.859999999999789 | 1.23 | 1.419 | 1.569 |
| 0.869999999999789 | 1.232 | 1.421 | 1.57 |
| 0.879999999999789 | 1.234 | 1.423 | 1.571 |
| 0.889999999999789 | 1.236 | 1.424 | 1.573 |
| 0.899999999999789 | 1.239 | 1.426 | 1.574 |
| 0.909999999999789 | 1.241 | 1.428 | 1.575 |
| 0.919999999999789 | 1.243 | 1.429 | 1.577 |
| 0.929999999999789 | 1.245 | 1.431 | 1.578 |
| 0.939999999999789 | 1.247 | 1.433 | 1.579 |
| 0.949999999999789 | 1.249 | 1.434 | 1.581 |
| 0.959999999999789 | 1.251 | 1.436 | 1.582 |
| 0.969999999999789 | 1.254 | 1.437 | 1.583 |
| 0.979999999999789 | 1.256 | 1.439 | 1.585 |
| 0.989999999999789 | 1.258 | 1.441 | 1.586 |
| 0.999999999999789 | 1.26 | 1.442 | 1.587 |
| 1.009999999999789 | 1.262 | 1.444 | 1.589 |
| 1.019999999999789 | 1.264 | 1.445 | 1.59 |
| 1.029999999999789 | 1.266 | 1.447 | 1.591 |
| 1.039999999999789 | 1.268 | 1.449 | 1.593 |
| 1.049999999999789 | 1.27 | 1.45 | 1.594 |
| 1.059999999999789 | 1.272 | 1.452 | 1.595 |
| 1.069999999999789 | 1.274 | 1.453 | 1.597 |
| 1.079999999999789 | 1.277 | 1.455 | 1.598 |
| 1.089999999999789 | 1.279 | 1.457 | 1.599 |
| 1.099999999999789 | 1.281 | 1.458 | 1.601 |
| 1.109999999999789 | 1.283 | 1.46 | 1.602 |
| 1.119999999999789 | 1.285 | 1.461 | 1.603 |
| 1.129999999999789 | 1.287 | 1.463 | 1.604 |
| 1.139999999999789 | 1.289 | 1.464 | 1.606 |
| 1.149999999999789 | 1.291 | 1.466 | 1.607 |
| 1.159999999999789 | 1.293 | 1.467 | 1.608 |
| 1.169999999999789 | 1.295 | 1.469 | 1.61 |
| 1.179999999999789 | 1.297 | 1.471 | 1.611 |
| 1.189999999999789 | 1.299 | 1.472 | 1.612 |
| 1.199999999999789 | 1.301 | 1.474 | 1.613 |
| 1.209999999999789 | 1.303 | 1.475 | 1.615 |
| 1.219999999999789 | 1.305 | 1.477 | 1.616 |
| 1.229999999999789 | 1.306 | 1.478 | 1.617 |
| 1.239999999999789 | 1.308 | 1.48 | 1.619 |
| 1.249999999999789 | 1.31 | 1.481 | 1.62 |
| 1.259999999999789 | 1.312 | 1.483 | 1.621 |
| 1.269999999999789 | 1.314 | 1.484 | 1.622 |
| 1.279999999999789 | 1.316 | 1.486 | 1.624 |
| 1.289999999999789 | 1.318 | 1.487 | 1.625 |
| 1.299999999999789 | 1.32 | 1.489 | 1.626 |
| 1.309999999999789 | 1.322 | 1.49 | 1.627 |
| 1.319999999999789 | 1.324 | 1.492 | 1.629 |
| 1.329999999999789 | 1.326 | 1.493 | 1.63 |
| 1.339999999999789 | 1.328 | 1.495 | 1.631 |
| 1.349999999999789 | 1.33 | 1.496 | 1.632 |
| 1.359999999999789 | 1.331 | 1.498 | 1.634 |
| 1.369999999999789 | 1.333 | 1.499 | 1.635 |
| 1.379999999999789 | 1.335 | 1.501 | 1.636 |
| 1.389999999999789 | 1.337 | 1.502 | 1.637 |
| 1.399999999999789 | 1.339 | 1.504 | 1.639 |
| 1.409999999999789 | 1.341 | 1.505 | 1.64 |
| 1.419999999999789 | 1.343 | 1.507 | 1.641 |
| 1.429999999999789 | 1.344 | 1.508 | 1.642 |
| 1.439999999999789 | 1.346 | 1.51 | 1.644 |
| 1.449999999999789 | 1.348 | 1.511 | 1.645 |
| 1.459999999999789 | 1.35 | 1.512 | 1.646 |
| 1.469999999999789 | 1.352 | 1.514 | 1.647 |
| 1.479999999999789 | 1.354 | 1.515 | 1.649 |
| 1.489999999999789 | 1.355 | 1.517 | 1.65 |
| 1.499999999999789 | 1.357 | 1.518 | 1.651 |
| 1.50999999999979 | 1.359 | 1.52 | 1.652 |
| 1.51999999999979 | 1.361 | 1.521 | 1.653 |
| 1.52999999999979 | 1.363 | 1.523 | 1.655 |
| 1.53999999999979 | 1.364 | 1.524 | 1.656 |
| 1.54999999999979 | 1.366 | 1.525 | 1.657 |
| 1.55999999999979 | 1.368 | 1.527 | 1.658 |
| 1.56999999999979 | 1.37 | 1.528 | 1.659 |
| 1.57999999999979 | 1.372 | 1.53 | 1.661 |
| 1.58999999999979 | 1.373 | 1.531 | 1.662 |
| 1.59999999999979 | 1.375 | 1.533 | 1.663 |
| 1.60999999999979 | 1.377 | 1.534 | 1.664 |
| 1.61999999999979 | 1.379 | 1.535 | 1.666 |
| 1.62999999999979 | 1.38 | 1.537 | 1.667 |
| 1.63999999999979 | 1.382 | 1.538 | 1.668 |
| 1.64999999999979 | 1.384 | 1.54 | 1.669 |
| 1.65999999999979 | 1.386 | 1.541 | 1.67 |
| 1.66999999999979 | 1.387 | 1.542 | 1.671 |
| 1.67999999999979 | 1.389 | 1.544 | 1.673 |
| 1.68999999999979 | 1.391 | 1.545 | 1.674 |
| 1.69999999999979 | 1.392 | 1.547 | 1.675 |
| 1.70999999999979 | 1.394 | 1.548 | 1.676 |
| 1.71999999999979 | 1.396 | 1.549 | 1.677 |
| 1.72999999999979 | 1.398 | 1.551 | 1.679 |
| 1.73999999999979 | 1.399 | 1.552 | 1.68 |
| 1.74999999999979 | 1.401 | 1.554 | 1.681 |
| 1.75999999999979 | 1.403 | 1.555 | 1.682 |
| 1.76999999999979 | 1.404 | 1.556 | 1.683 |
| 1.77999999999979 | 1.406 | 1.558 | 1.685 |
| 1.78999999999979 | 1.408 | 1.559 | 1.686 |
| 1.79999999999979 | 1.409 | 1.56 | 1.687 |
| 1.80999999999979 | 1.411 | 1.562 | 1.688 |
| 1.81999999999979 | 1.413 | 1.563 | 1.689 |
| 1.82999999999979 | 1.414 | 1.565 | 1.69 |
| 1.83999999999979 | 1.416 | 1.566 | 1.692 |
| 1.84999999999979 | 1.418 | 1.567 | 1.693 |
| 1.85999999999979 | 1.419 | 1.569 | 1.694 |
| 1.86999999999979 | 1.421 | 1.57 | 1.695 |
| 1.87999999999979 | 1.423 | 1.571 | 1.696 |
| 1.88999999999979 | 1.424 | 1.573 | 1.697 |
| 1.89999999999979 | 1.426 | 1.574 | 1.698 |
| 1.90999999999979 | 1.428 | 1.575 | 1.7 |
| 1.91999999999979 | 1.429 | 1.577 | 1.701 |
| 1.92999999999979 | 1.431 | 1.578 | 1.702 |
| 1.93999999999979 | 1.433 | 1.579 | 1.703 |
| 1.94999999999979 | 1.434 | 1.581 | 1.704 |
| 1.95999999999979 | 1.436 | 1.582 | 1.705 |
| 1.96999999999979 | 1.437 | 1.583 | 1.707 |
| 1.97999999999979 | 1.439 | 1.585 | 1.708 |
| 1.98999999999979 | 1.441 | 1.586 | 1.709 |
| 1.99999999999979 | 1.442 | 1.587 | 1.71 |
| 2.00999999999979 | 1.444 | 1.589 | 1.711 |
| 2.01999999999979 | 1.445 | 1.59 | 1.712 |
| 2.029999999999789 | 1.447 | 1.591 | 1.713 |
| 2.039999999999789 | 1.449 | 1.593 | 1.715 |
| 2.049999999999789 | 1.45 | 1.594 | 1.716 |
| 2.059999999999789 | 1.452 | 1.595 | 1.717 |
| 2.069999999999788 | 1.453 | 1.597 | 1.718 |
| 2.079999999999788 | 1.455 | 1.598 | 1.719 |
| 2.089999999999788 | 1.457 | 1.599 | 1.72 |
| 2.099999999999788 | 1.458 | 1.601 | 1.721 |
| 2.109999999999788 | 1.46 | 1.602 | 1.722 |
| 2.119999999999787 | 1.461 | 1.603 | 1.724 |
| 2.129999999999787 | 1.463 | 1.604 | 1.725 |
| 2.139999999999787 | 1.464 | 1.606 | 1.726 |
| 2.149999999999787 | 1.466 | 1.607 | 1.727 |
| 2.159999999999787 | 1.467 | 1.608 | 1.728 |
| 2.169999999999786 | 1.469 | 1.61 | 1.729 |
| 2.179999999999786 | 1.471 | 1.611 | 1.73 |
| 2.189999999999786 | 1.472 | 1.612 | 1.731 |
| 2.199999999999786 | 1.474 | 1.613 | 1.732 |
| 2.209999999999785 | 1.475 | 1.615 | 1.734 |
| 2.219999999999785 | 1.477 | 1.616 | 1.735 |
| 2.229999999999785 | 1.478 | 1.617 | 1.736 |
| 2.239999999999785 | 1.48 | 1.619 | 1.737 |
| 2.249999999999785 | 1.481 | 1.62 | 1.738 |
| 2.259999999999784 | 1.483 | 1.621 | 1.739 |
| 2.269999999999784 | 1.484 | 1.622 | 1.74 |
| 2.279999999999784 | 1.486 | 1.624 | 1.741 |
| 2.289999999999784 | 1.487 | 1.625 | 1.742 |
| 2.299999999999784 | 1.489 | 1.626 | 1.744 |
| 2.309999999999783 | 1.49 | 1.627 | 1.745 |
| 2.319999999999783 | 1.492 | 1.629 | 1.746 |
| 2.329999999999783 | 1.493 | 1.63 | 1.747 |
| 2.339999999999783 | 1.495 | 1.631 | 1.748 |
| 2.349999999999782 | 1.496 | 1.632 | 1.749 |
| 2.359999999999782 | 1.498 | 1.634 | 1.75 |
| 2.369999999999782 | 1.499 | 1.635 | 1.751 |
| 2.379999999999782 | 1.501 | 1.636 | 1.752 |
| 2.389999999999782 | 1.502 | 1.637 | 1.753 |
| 2.399999999999781 | 1.504 | 1.639 | 1.754 |
| 2.409999999999781 | 1.505 | 1.64 | 1.755 |
| 2.419999999999781 | 1.507 | 1.641 | 1.757 |
| 2.429999999999781 | 1.508 | 1.642 | 1.758 |
| 2.439999999999781 | 1.51 | 1.644 | 1.759 |
| 2.44999999999978 | 1.511 | 1.645 | 1.76 |
| 2.45999999999978 | 1.512 | 1.646 | 1.761 |
| 2.46999999999978 | 1.514 | 1.647 | 1.762 |
| 2.47999999999978 | 1.515 | 1.649 | 1.763 |
| 2.489999999999779 | 1.517 | 1.65 | 1.764 |
| 2.499999999999779 | 1.518 | 1.651 | 1.765 |
| 2.509999999999779 | 1.52 | 1.652 | 1.766 |
| 2.519999999999779 | 1.521 | 1.653 | 1.767 |
| 2.529999999999779 | 1.523 | 1.655 | 1.768 |
| 2.539999999999778 | 1.524 | 1.656 | 1.769 |
| 2.549999999999778 | 1.525 | 1.657 | 1.771 |
| 2.559999999999778 | 1.527 | 1.658 | 1.772 |
| 2.569999999999778 | 1.528 | 1.659 | 1.773 |
| 2.579999999999778 | 1.53 | 1.661 | 1.774 |
| 2.589999999999777 | 1.531 | 1.662 | 1.775 |
| 2.599999999999777 | 1.533 | 1.663 | 1.776 |
| 2.609999999999777 | 1.534 | 1.664 | 1.777 |
| 2.619999999999777 | 1.535 | 1.666 | 1.778 |
| 2.629999999999776 | 1.537 | 1.667 | 1.779 |
| 2.639999999999776 | 1.538 | 1.668 | 1.78 |
| 2.649999999999776 | 1.54 | 1.669 | 1.781 |
| 2.659999999999776 | 1.541 | 1.67 | 1.782 |
| 2.669999999999776 | 1.542 | 1.671 | 1.783 |
| 2.679999999999775 | 1.544 | 1.673 | 1.784 |
| 2.689999999999775 | 1.545 | 1.674 | 1.785 |
| 2.699999999999775 | 1.547 | 1.675 | 1.786 |
| 2.709999999999775 | 1.548 | 1.676 | 1.787 |
| 2.719999999999775 | 1.549 | 1.677 | 1.788 |
| 2.729999999999774 | 1.551 | 1.679 | 1.789 |
| 2.739999999999774 | 1.552 | 1.68 | 1.79 |
| 2.749999999999774 | 1.554 | 1.681 | 1.792 |
| 2.759999999999774 | 1.555 | 1.682 | 1.793 |
| 2.769999999999773 | 1.556 | 1.683 | 1.794 |
| 2.779999999999773 | 1.558 | 1.685 | 1.795 |
| 2.789999999999773 | 1.559 | 1.686 | 1.796 |
| 2.799999999999773 | 1.56 | 1.687 | 1.797 |
| 2.809999999999773 | 1.562 | 1.688 | 1.798 |
| 2.819999999999772 | 1.563 | 1.689 | 1.799 |
| 2.829999999999772 | 1.565 | 1.69 | 1.8 |
| 2.839999999999772 | 1.566 | 1.692 | 1.801 |
| 2.849999999999772 | 1.567 | 1.693 | 1.802 |
| 2.859999999999772 | 1.569 | 1.694 | 1.803 |
| 2.869999999999771 | 1.57 | 1.695 | 1.804 |
| 2.879999999999771 | 1.571 | 1.696 | 1.805 |
| 2.889999999999771 | 1.573 | 1.697 | 1.806 |
| 2.899999999999771 | 1.574 | 1.698 | 1.807 |
| 2.909999999999771 | 1.575 | 1.7 | 1.808 |
| 2.91999999999977 | 1.577 | 1.701 | 1.809 |
| 2.92999999999977 | 1.578 | 1.702 | 1.81 |
| 2.93999999999977 | 1.579 | 1.703 | 1.811 |
| 2.94999999999977 | 1.581 | 1.704 | 1.812 |
| 2.959999999999769 | 1.582 | 1.705 | 1.813 |
| 2.969999999999769 | 1.583 | 1.707 | 1.814 |
| 2.979999999999769 | 1.585 | 1.708 | 1.815 |
| 2.989999999999769 | 1.586 | 1.709 | 1.816 |
| 2.999999999999769 | 1.587 | 1.71 | 1.817 |
| 3.009999999999768 | 1.589 | 1.711 | 1.818 |
| 3.019999999999768 | 1.59 | 1.712 | 1.819 |
| 3.029999999999768 | 1.591 | 1.713 | 1.82 |
| 3.039999999999768 | 1.593 | 1.715 | 1.821 |
| 3.049999999999768 | 1.594 | 1.716 | 1.822 |
| 3.059999999999767 | 1.595 | 1.717 | 1.823 |
| 3.069999999999767 | 1.597 | 1.718 | 1.824 |
| 3.079999999999767 | 1.598 | 1.719 | 1.825 |
| 3.089999999999767 | 1.599 | 1.72 | 1.826 |
| 3.099999999999766 | 1.601 | 1.721 | 1.827 |
| 3.109999999999766 | 1.602 | 1.722 | 1.828 |
| 3.119999999999766 | 1.603 | 1.724 | 1.829 |
| 3.129999999999766 | 1.604 | 1.725 | 1.83 |
| 3.139999999999766 | 1.606 | 1.726 | 1.831 |
| 3.149999999999765 | 1.607 | 1.727 | 1.832 |
| 3.159999999999765 | 1.608 | 1.728 | 1.833 |
| 3.169999999999765 | 1.61 | 1.729 | 1.834 |
| 3.179999999999765 | 1.611 | 1.73 | 1.835 |
| 3.189999999999765 | 1.612 | 1.731 | 1.836 |
| 3.199999999999764 | 1.613 | 1.732 | 1.837 |
| 3.209999999999764 | 1.615 | 1.734 | 1.838 |
| 3.219999999999764 | 1.616 | 1.735 | 1.839 |
| 3.229999999999764 | 1.617 | 1.736 | 1.84 |
| 3.239999999999763 | 1.619 | 1.737 | 1.841 |
| 3.249999999999763 | 1.62 | 1.738 | 1.842 |
| 3.259999999999763 | 1.621 | 1.739 | 1.843 |
| 3.269999999999763 | 1.622 | 1.74 | 1.844 |
| 3.279999999999763 | 1.624 | 1.741 | 1.845 |
| 3.289999999999762 | 1.625 | 1.742 | 1.846 |
| 3.299999999999762 | 1.626 | 1.744 | 1.847 |
| 3.309999999999762 | 1.627 | 1.745 | 1.848 |
| 3.319999999999762 | 1.629 | 1.746 | 1.849 |
| 3.329999999999762 | 1.63 | 1.747 | 1.85 |
| 3.339999999999761 | 1.631 | 1.748 | 1.851 |
| 3.349999999999761 | 1.632 | 1.749 | 1.852 |
| 3.359999999999761 | 1.634 | 1.75 | 1.853 |
| 3.369999999999761 | 1.635 | 1.751 | 1.854 |
| 3.37999999999976 | 1.636 | 1.752 | 1.855 |
| 3.38999999999976 | 1.637 | 1.753 | 1.856 |
| 3.39999999999976 | 1.639 | 1.754 | 1.857 |
| 3.40999999999976 | 1.64 | 1.755 | 1.858 |
| 3.41999999999976 | 1.641 | 1.757 | 1.859 |
| 3.429999999999759 | 1.642 | 1.758 | 1.86 |
| 3.439999999999759 | 1.644 | 1.759 | 1.86 |
| 3.449999999999759 | 1.645 | 1.76 | 1.861 |
| 3.459999999999759 | 1.646 | 1.761 | 1.862 |
| 3.469999999999759 | 1.647 | 1.762 | 1.863 |
| 3.479999999999758 | 1.649 | 1.763 | 1.864 |
| 3.489999999999758 | 1.65 | 1.764 | 1.865 |
| 3.499999999999758 | 1.651 | 1.765 | 1.866 |
| 3.509999999999758 | 1.652 | 1.766 | 1.867 |
| 3.519999999999758 | 1.653 | 1.767 | 1.868 |
| 3.529999999999757 | 1.655 | 1.768 | 1.869 |
| 3.539999999999757 | 1.656 | 1.769 | 1.87 |
| 3.549999999999757 | 1.657 | 1.771 | 1.871 |
| 3.559999999999757 | 1.658 | 1.772 | 1.872 |
| 3.569999999999756 | 1.659 | 1.773 | 1.873 |
| 3.579999999999756 | 1.661 | 1.774 | 1.874 |
| 3.589999999999756 | 1.662 | 1.775 | 1.875 |
| 3.599999999999756 | 1.663 | 1.776 | 1.876 |
| 3.609999999999756 | 1.664 | 1.777 | 1.877 |
| 3.619999999999755 | 1.666 | 1.778 | 1.878 |
| 3.629999999999755 | 1.667 | 1.779 | 1.879 |
| 3.639999999999755 | 1.668 | 1.78 | 1.88 |
| 3.649999999999755 | 1.669 | 1.781 | 1.881 |
| 3.659999999999754 | 1.67 | 1.782 | 1.881 |
| 3.669999999999754 | 1.671 | 1.783 | 1.882 |
| 3.679999999999754 | 1.673 | 1.784 | 1.883 |
| 3.689999999999754 | 1.674 | 1.785 | 1.884 |
| 3.699999999999754 | 1.675 | 1.786 | 1.885 |
| 3.709999999999753 | 1.676 | 1.787 | 1.886 |
| 3.719999999999753 | 1.677 | 1.788 | 1.887 |
| 3.729999999999753 | 1.679 | 1.789 | 1.888 |
| 3.739999999999753 | 1.68 | 1.79 | 1.889 |
| 3.749999999999753 | 1.681 | 1.792 | 1.89 |
| 3.759999999999752 | 1.682 | 1.793 | 1.891 |
| 3.769999999999752 | 1.683 | 1.794 | 1.892 |
| 3.779999999999752 | 1.685 | 1.795 | 1.893 |
| 3.789999999999752 | 1.686 | 1.796 | 1.894 |
| 3.799999999999751 | 1.687 | 1.797 | 1.895 |
| 3.809999999999751 | 1.688 | 1.798 | 1.895 |
| 3.819999999999751 | 1.689 | 1.799 | 1.896 |
| 3.829999999999751 | 1.69 | 1.8 | 1.897 |
| 3.839999999999751 | 1.692 | 1.801 | 1.898 |
| 3.84999999999975 | 1.693 | 1.802 | 1.899 |
| 3.85999999999975 | 1.694 | 1.803 | 1.9 |
| 3.86999999999975 | 1.695 | 1.804 | 1.901 |
| 3.87999999999975 | 1.696 | 1.805 | 1.902 |
| 3.88999999999975 | 1.697 | 1.806 | 1.903 |
| 3.899999999999749 | 1.698 | 1.807 | 1.904 |
| 3.909999999999749 | 1.7 | 1.808 | 1.905 |
| 3.919999999999749 | 1.701 | 1.809 | 1.906 |
| 3.929999999999749 | 1.702 | 1.81 | 1.907 |
| 3.939999999999749 | 1.703 | 1.811 | 1.907 |
| 3.949999999999748 | 1.704 | 1.812 | 1.908 |
| 3.959999999999748 | 1.705 | 1.813 | 1.909 |
| 3.969999999999748 | 1.707 | 1.814 | 1.91 |
| 3.979999999999748 | 1.708 | 1.815 | 1.911 |
| 3.989999999999747 | 1.709 | 1.816 | 1.912 |
| 3.999999999999747 | 1.71 | 1.817 | 1.913 |
| 4.009999999999747 | 1.711 | 1.818 | 1.914 |
| 4.019999999999747 | 1.712 | 1.819 | 1.915 |
| 4.029999999999747 | 1.713 | 1.82 | 1.916 |
| 4.039999999999746 | 1.715 | 1.821 | 1.917 |
| 4.049999999999746 | 1.716 | 1.822 | 1.917 |
| 4.059999999999746 | 1.717 | 1.823 | 1.918 |
| 4.069999999999746 | 1.718 | 1.824 | 1.919 |
| 4.079999999999746 | 1.719 | 1.825 | 1.92 |
| 4.089999999999745 | 1.72 | 1.826 | 1.921 |
| 4.099999999999745 | 1.721 | 1.827 | 1.922 |
| 4.109999999999745 | 1.722 | 1.828 | 1.923 |
| 4.119999999999745 | 1.724 | 1.829 | 1.924 |
| 4.129999999999745 | 1.725 | 1.83 | 1.925 |
| 4.139999999999744 | 1.726 | 1.831 | 1.926 |
| 4.149999999999744 | 1.727 | 1.832 | 1.926 |
| 4.159999999999744 | 1.728 | 1.833 | 1.927 |
| 4.169999999999744 | 1.729 | 1.834 | 1.928 |
| 4.179999999999744 | 1.73 | 1.835 | 1.929 |
| 4.189999999999744 | 1.731 | 1.836 | 1.93 |
| 4.199999999999743 | 1.732 | 1.837 | 1.931 |
| 4.209999999999743 | 1.734 | 1.838 | 1.932 |
| 4.219999999999743 | 1.735 | 1.839 | 1.933 |
| 4.229999999999743 | 1.736 | 1.84 | 1.934 |
| 4.239999999999742 | 1.737 | 1.841 | 1.935 |
| 4.249999999999742 | 1.738 | 1.842 | 1.935 |
| 4.259999999999742 | 1.739 | 1.843 | 1.936 |
| 4.269999999999742 | 1.74 | 1.844 | 1.937 |
| 4.279999999999741 | 1.741 | 1.845 | 1.938 |
| 4.289999999999741 | 1.742 | 1.846 | 1.939 |
| 4.299999999999741 | 1.744 | 1.847 | 1.94 |
| 4.309999999999741 | 1.745 | 1.848 | 1.941 |
| 4.319999999999741 | 1.746 | 1.849 | 1.942 |
| 4.329999999999741 | 1.747 | 1.85 | 1.943 |
| 4.33999999999974 | 1.748 | 1.851 | 1.943 |
| 4.34999999999974 | 1.749 | 1.852 | 1.944 |
| 4.35999999999974 | 1.75 | 1.853 | 1.945 |
| 4.36999999999974 | 1.751 | 1.854 | 1.946 |
| 4.37999999999974 | 1.752 | 1.855 | 1.947 |
| 4.38999999999974 | 1.753 | 1.856 | 1.948 |
| 4.39999999999974 | 1.754 | 1.857 | 1.949 |
| 4.409999999999738 | 1.755 | 1.858 | 1.95 |
| 4.419999999999738 | 1.757 | 1.859 | 1.95 |
| 4.429999999999738 | 1.758 | 1.86 | 1.951 |
| 4.439999999999738 | 1.759 | 1.86 | 1.952 |
| 4.449999999999738 | 1.76 | 1.861 | 1.953 |
| 4.459999999999737 | 1.761 | 1.862 | 1.954 |
| 4.469999999999737 | 1.762 | 1.863 | 1.955 |
| 4.479999999999737 | 1.763 | 1.864 | 1.956 |
| 4.489999999999737 | 1.764 | 1.865 | 1.957 |
| 4.499999999999737 | 1.765 | 1.866 | 1.957 |
| 4.509999999999736 | 1.766 | 1.867 | 1.958 |
| 4.519999999999736 | 1.767 | 1.868 | 1.959 |
| 4.529999999999736 | 1.768 | 1.869 | 1.96 |
| 4.539999999999736 | 1.769 | 1.87 | 1.961 |
| 4.549999999999736 | 1.771 | 1.871 | 1.962 |
| 4.559999999999735 | 1.772 | 1.872 | 1.963 |
| 4.569999999999735 | 1.773 | 1.873 | 1.964 |
| 4.579999999999735 | 1.774 | 1.874 | 1.964 |
| 4.589999999999735 | 1.775 | 1.875 | 1.965 |
| 4.599999999999734 | 1.776 | 1.876 | 1.966 |
| 4.609999999999734 | 1.777 | 1.877 | 1.967 |
| 4.619999999999734 | 1.778 | 1.878 | 1.968 |
| 4.629999999999734 | 1.779 | 1.879 | 1.969 |
| 4.639999999999734 | 1.78 | 1.88 | 1.97 |
| 4.649999999999734 | 1.781 | 1.881 | 1.97 |
| 4.659999999999734 | 1.782 | 1.881 | 1.971 |
| 4.669999999999733 | 1.783 | 1.882 | 1.972 |
| 4.679999999999733 | 1.784 | 1.883 | 1.973 |
| 4.689999999999733 | 1.785 | 1.884 | 1.974 |
| 4.699999999999733 | 1.786 | 1.885 | 1.975 |
| 4.709999999999732 | 1.787 | 1.886 | 1.976 |
| 4.719999999999732 | 1.788 | 1.887 | 1.976 |
| 4.729999999999732 | 1.789 | 1.888 | 1.977 |
| 4.739999999999731 | 1.79 | 1.889 | 1.978 |
| 4.749999999999731 | 1.792 | 1.89 | 1.979 |
| 4.759999999999731 | 1.793 | 1.891 | 1.98 |
| 4.769999999999731 | 1.794 | 1.892 | 1.981 |
| 4.77999999999973 | 1.795 | 1.893 | 1.981 |
| 4.78999999999973 | 1.796 | 1.894 | 1.982 |
| 4.79999999999973 | 1.797 | 1.895 | 1.983 |
| 4.80999999999973 | 1.798 | 1.895 | 1.984 |
| 4.81999999999973 | 1.799 | 1.896 | 1.985 |
| 4.82999999999973 | 1.8 | 1.897 | 1.986 |
| 4.83999999999973 | 1.801 | 1.898 | 1.987 |
| 4.84999999999973 | 1.802 | 1.899 | 1.987 |
| 4.85999999999973 | 1.803 | 1.9 | 1.988 |
| 4.86999999999973 | 1.804 | 1.901 | 1.989 |
| 4.879999999999728 | 1.805 | 1.902 | 1.99 |
| 4.889999999999728 | 1.806 | 1.903 | 1.991 |
| 4.899999999999728 | 1.807 | 1.904 | 1.992 |
| 4.909999999999728 | 1.808 | 1.905 | 1.992 |
| 4.919999999999728 | 1.809 | 1.906 | 1.993 |
| 4.929999999999727 | 1.81 | 1.907 | 1.994 |
| 4.939999999999727 | 1.811 | 1.907 | 1.995 |
| 4.949999999999727 | 1.812 | 1.908 | 1.996 |
| 4.959999999999727 | 1.813 | 1.909 | 1.997 |
| 4.969999999999727 | 1.814 | 1.91 | 1.997 |
| 4.979999999999726 | 1.815 | 1.911 | 1.998 |
| 4.989999999999726 | 1.816 | 1.912 | 1.999 |
| 4.999999999999726 | 1.817 | 1.913 | 2 |
| 5.009999999999726 | 1.818 | 1.914 | 2.001 |
| 5.019999999999726 | 1.819 | 1.915 | 2.002 |
| 5.029999999999725 | 1.82 | 1.916 | 2.002 |
| 5.039999999999725 | 1.821 | 1.917 | 2.003 |
| 5.049999999999725 | 1.822 | 1.917 | 2.004 |
| 5.059999999999725 | 1.823 | 1.918 | 2.005 |
| 5.069999999999724 | 1.824 | 1.919 | 2.006 |
| 5.079999999999724 | 1.825 | 1.92 | 2.007 |
| 5.089999999999724 | 1.826 | 1.921 | 2.007 |
| 5.099999999999724 | 1.827 | 1.922 | 2.008 |
| 5.109999999999724 | 1.828 | 1.923 | 2.009 |
| 5.119999999999724 | 1.829 | 1.924 | 2.01 |
| 5.129999999999724 | 1.83 | 1.925 | 2.011 |
| 5.139999999999723 | 1.831 | 1.926 | 2.012 |
| 5.149999999999723 | 1.832 | 1.926 | 2.012 |
| 5.159999999999723 | 1.833 | 1.927 | 2.013 |
| 5.169999999999723 | 1.834 | 1.928 | 2.014 |
| 5.179999999999722 | 1.835 | 1.929 | 2.015 |
| 5.189999999999722 | 1.836 | 1.93 | 2.016 |
| 5.199999999999722 | 1.837 | 1.931 | 2.017 |
| 5.209999999999721 | 1.838 | 1.932 | 2.017 |
| 5.219999999999721 | 1.839 | 1.933 | 2.018 |
| 5.229999999999721 | 1.84 | 1.934 | 2.019 |
| 5.23999999999972 | 1.841 | 1.935 | 2.02 |
| 5.24999999999972 | 1.842 | 1.935 | 2.021 |
| 5.25999999999972 | 1.843 | 1.936 | 2.021 |
| 5.26999999999972 | 1.844 | 1.937 | 2.022 |
| 5.27999999999972 | 1.845 | 1.938 | 2.023 |
| 5.28999999999972 | 1.846 | 1.939 | 2.024 |
| 5.29999999999972 | 1.847 | 1.94 | 2.025 |
| 5.30999999999972 | 1.848 | 1.941 | 2.026 |
| 5.31999999999972 | 1.849 | 1.942 | 2.026 |
| 5.329999999999719 | 1.85 | 1.943 | 2.027 |
| 5.33999999999972 | 1.851 | 1.943 | 2.028 |
| 5.349999999999719 | 1.852 | 1.944 | 2.029 |
| 5.359999999999719 | 1.853 | 1.945 | 2.03 |
| 5.369999999999718 | 1.854 | 1.946 | 2.03 |
| 5.379999999999718 | 1.855 | 1.947 | 2.031 |
| 5.389999999999718 | 1.856 | 1.948 | 2.032 |
| 5.399999999999718 | 1.857 | 1.949 | 2.033 |
| 5.409999999999717 | 1.858 | 1.95 | 2.034 |
| 5.419999999999717 | 1.859 | 1.95 | 2.034 |
| 5.429999999999717 | 1.86 | 1.951 | 2.035 |
| 5.439999999999717 | 1.86 | 1.952 | 2.036 |
| 5.449999999999716 | 1.861 | 1.953 | 2.037 |
| 5.459999999999716 | 1.862 | 1.954 | 2.038 |
| 5.469999999999716 | 1.863 | 1.955 | 2.038 |
| 5.479999999999716 | 1.864 | 1.956 | 2.039 |
| 5.489999999999715 | 1.865 | 1.957 | 2.04 |
| 5.499999999999715 | 1.866 | 1.957 | 2.041 |
| 5.509999999999715 | 1.867 | 1.958 | 2.042 |
| 5.519999999999715 | 1.868 | 1.959 | 2.042 |
| 5.529999999999715 | 1.869 | 1.96 | 2.043 |
| 5.539999999999714 | 1.87 | 1.961 | 2.044 |
| 5.549999999999714 | 1.871 | 1.962 | 2.045 |
| 5.559999999999714 | 1.872 | 1.963 | 2.046 |
| 5.569999999999714 | 1.873 | 1.964 | 2.046 |
| 5.579999999999714 | 1.874 | 1.964 | 2.047 |
| 5.589999999999714 | 1.875 | 1.965 | 2.048 |
| 5.599999999999714 | 1.876 | 1.966 | 2.049 |
| 5.609999999999713 | 1.877 | 1.967 | 2.05 |
| 5.619999999999713 | 1.878 | 1.968 | 2.05 |
| 5.629999999999713 | 1.879 | 1.969 | 2.051 |
| 5.639999999999713 | 1.88 | 1.97 | 2.052 |
| 5.649999999999712 | 1.881 | 1.97 | 2.053 |
| 5.659999999999712 | 1.881 | 1.971 | 2.054 |
| 5.669999999999712 | 1.882 | 1.972 | 2.054 |
| 5.679999999999712 | 1.883 | 1.973 | 2.055 |
| 5.689999999999712 | 1.884 | 1.974 | 2.056 |
| 5.699999999999711 | 1.885 | 1.975 | 2.057 |
| 5.709999999999711 | 1.886 | 1.976 | 2.057 |
| 5.719999999999711 | 1.887 | 1.976 | 2.058 |
| 5.729999999999711 | 1.888 | 1.977 | 2.059 |
| 5.73999999999971 | 1.889 | 1.978 | 2.06 |
| 5.74999999999971 | 1.89 | 1.979 | 2.061 |
| 5.75999999999971 | 1.891 | 1.98 | 2.061 |
| 5.76999999999971 | 1.892 | 1.981 | 2.062 |
| 5.77999999999971 | 1.893 | 1.981 | 2.063 |
| 5.78999999999971 | 1.894 | 1.982 | 2.064 |
| 5.79999999999971 | 1.895 | 1.983 | 2.065 |
| 5.80999999999971 | 1.895 | 1.984 | 2.065 |
| 5.819999999999709 | 1.896 | 1.985 | 2.066 |
| 5.829999999999709 | 1.897 | 1.986 | 2.067 |
| 5.839999999999708 | 1.898 | 1.987 | 2.068 |
| 5.849999999999708 | 1.899 | 1.987 | 2.068 |
| 5.859999999999708 | 1.9 | 1.988 | 2.069 |
| 5.869999999999708 | 1.901 | 1.989 | 2.07 |
| 5.879999999999707 | 1.902 | 1.99 | 2.071 |
| 5.889999999999707 | 1.903 | 1.991 | 2.072 |
| 5.899999999999707 | 1.904 | 1.992 | 2.072 |
| 5.909999999999707 | 1.905 | 1.992 | 2.073 |
| 5.919999999999706 | 1.906 | 1.993 | 2.074 |
| 5.929999999999706 | 1.907 | 1.994 | 2.075 |
| 5.939999999999706 | 1.907 | 1.995 | 2.075 |
| 5.949999999999706 | 1.908 | 1.996 | 2.076 |
| 5.959999999999705 | 1.909 | 1.997 | 2.077 |
| 5.969999999999705 | 1.91 | 1.997 | 2.078 |
| 5.979999999999705 | 1.911 | 1.998 | 2.079 |
| 5.989999999999705 | 1.912 | 1.999 | 2.079 |
| 5.999999999999705 | 1.913 | 2 | 2.08 |
| 6.009999999999704 | 1.914 | 2.001 | 2.081 |
| 6.019999999999704 | 1.915 | 2.002 | 2.082 |
| 6.029999999999704 | 1.916 | 2.002 | 2.082 |
| 6.039999999999704 | 1.917 | 2.003 | 2.083 |
| 6.049999999999704 | 1.917 | 2.004 | 2.084 |
| 6.059999999999704 | 1.918 | 2.005 | 2.085 |
| 6.069999999999704 | 1.919 | 2.006 | 2.085 |
| 6.079999999999703 | 1.92 | 2.007 | 2.086 |
| 6.089999999999703 | 1.921 | 2.007 | 2.087 |
| 6.099999999999703 | 1.922 | 2.008 | 2.088 |
| 6.109999999999703 | 1.923 | 2.009 | 2.089 |
| 6.119999999999703 | 1.924 | 2.01 | 2.089 |
| 6.129999999999702 | 1.925 | 2.011 | 2.09 |
| 6.139999999999702 | 1.926 | 2.012 | 2.091 |
| 6.149999999999702 | 1.926 | 2.012 | 2.092 |
| 6.159999999999702 | 1.927 | 2.013 | 2.092 |
| 6.169999999999701 | 1.928 | 2.014 | 2.093 |
| 6.179999999999701 | 1.929 | 2.015 | 2.094 |
| 6.189999999999701 | 1.93 | 2.016 | 2.095 |
| 6.199999999999701 | 1.931 | 2.017 | 2.095 |
| 6.2099999999997 | 1.932 | 2.017 | 2.096 |
| 6.2199999999997 | 1.933 | 2.018 | 2.097 |
| 6.2299999999997 | 1.934 | 2.019 | 2.098 |
| 6.2399999999997 | 1.935 | 2.02 | 2.098 |
| 6.2499999999997 | 1.935 | 2.021 | 2.099 |
| 6.2599999999997 | 1.936 | 2.021 | 2.1 |
| 6.2699999999997 | 1.937 | 2.022 | 2.101 |
| 6.2799999999997 | 1.938 | 2.023 | 2.101 |
| 6.289999999999698 | 1.939 | 2.024 | 2.102 |
| 6.299999999999698 | 1.94 | 2.025 | 2.103 |
| 6.309999999999698 | 1.941 | 2.026 | 2.104 |
| 6.319999999999698 | 1.942 | 2.026 | 2.104 |
| 6.329999999999698 | 1.943 | 2.027 | 2.105 |
| 6.339999999999697 | 1.943 | 2.028 | 2.106 |
| 6.349999999999697 | 1.944 | 2.029 | 2.107 |
| 6.359999999999697 | 1.945 | 2.03 | 2.107 |
| 6.369999999999697 | 1.946 | 2.03 | 2.108 |
| 6.379999999999696 | 1.947 | 2.031 | 2.109 |
| 6.389999999999696 | 1.948 | 2.032 | 2.11 |
| 6.399999999999696 | 1.949 | 2.033 | 2.11 |
| 6.409999999999696 | 1.95 | 2.034 | 2.111 |
| 6.419999999999696 | 1.95 | 2.034 | 2.112 |
| 6.429999999999695 | 1.951 | 2.035 | 2.113 |
| 6.439999999999695 | 1.952 | 2.036 | 2.113 |
| 6.449999999999695 | 1.953 | 2.037 | 2.114 |
| 6.459999999999695 | 1.954 | 2.038 | 2.115 |
| 6.469999999999695 | 1.955 | 2.038 | 2.116 |
| 6.479999999999694 | 1.956 | 2.039 | 2.116 |
| 6.489999999999694 | 1.957 | 2.04 | 2.117 |
| 6.499999999999694 | 1.957 | 2.041 | 2.118 |
| 6.509999999999694 | 1.958 | 2.042 | 2.119 |
| 6.519999999999694 | 1.959 | 2.042 | 2.119 |
| 6.529999999999694 | 1.96 | 2.043 | 2.12 |
| 6.539999999999693 | 1.961 | 2.044 | 2.121 |
| 6.549999999999693 | 1.962 | 2.045 | 2.122 |
| 6.559999999999693 | 1.963 | 2.046 | 2.122 |
| 6.569999999999693 | 1.964 | 2.046 | 2.123 |
| 6.579999999999692 | 1.964 | 2.047 | 2.124 |
| 6.589999999999692 | 1.965 | 2.048 | 2.125 |
| 6.599999999999692 | 1.966 | 2.049 | 2.125 |
| 6.609999999999692 | 1.967 | 2.05 | 2.126 |
| 6.619999999999692 | 1.968 | 2.05 | 2.127 |
| 6.629999999999692 | 1.969 | 2.051 | 2.128 |
| 6.639999999999691 | 1.97 | 2.052 | 2.128 |
| 6.649999999999691 | 1.97 | 2.053 | 2.129 |
| 6.659999999999691 | 1.971 | 2.054 | 2.13 |
| 6.669999999999691 | 1.972 | 2.054 | 2.13 |
| 6.67999999999969 | 1.973 | 2.055 | 2.131 |
| 6.68999999999969 | 1.974 | 2.056 | 2.132 |
| 6.69999999999969 | 1.975 | 2.057 | 2.133 |
| 6.70999999999969 | 1.976 | 2.057 | 2.133 |
| 6.71999999999969 | 1.976 | 2.058 | 2.134 |
| 6.72999999999969 | 1.977 | 2.059 | 2.135 |
| 6.73999999999969 | 1.978 | 2.06 | 2.136 |
| 6.74999999999969 | 1.979 | 2.061 | 2.136 |
| 6.759999999999688 | 1.98 | 2.061 | 2.137 |
| 6.769999999999688 | 1.981 | 2.062 | 2.138 |
| 6.779999999999688 | 1.981 | 2.063 | 2.139 |
| 6.789999999999688 | 1.982 | 2.064 | 2.139 |
| 6.799999999999687 | 1.983 | 2.065 | 2.14 |
| 6.809999999999687 | 1.984 | 2.065 | 2.141 |
| 6.819999999999687 | 1.985 | 2.066 | 2.141 |
| 6.829999999999687 | 1.986 | 2.067 | 2.142 |
| 6.839999999999687 | 1.987 | 2.068 | 2.143 |
| 6.849999999999686 | 1.987 | 2.068 | 2.144 |
| 6.859999999999686 | 1.988 | 2.069 | 2.144 |
| 6.869999999999686 | 1.989 | 2.07 | 2.145 |
| 6.879999999999686 | 1.99 | 2.071 | 2.146 |
| 6.889999999999686 | 1.991 | 2.072 | 2.147 |
| 6.899999999999685 | 1.992 | 2.072 | 2.147 |
| 6.909999999999685 | 1.992 | 2.073 | 2.148 |
| 6.919999999999685 | 1.993 | 2.074 | 2.149 |
| 6.929999999999685 | 1.994 | 2.075 | 2.149 |
| 6.939999999999685 | 1.995 | 2.075 | 2.15 |
| 6.949999999999684 | 1.996 | 2.076 | 2.151 |
| 6.959999999999684 | 1.997 | 2.077 | 2.152 |
| 6.969999999999684 | 1.997 | 2.078 | 2.152 |
| 6.979999999999684 | 1.998 | 2.079 | 2.153 |
| 6.989999999999683 | 1.999 | 2.079 | 2.154 |
| 6.999999999999683 | 2 | 2.08 | 2.154 |
| 7.009999999999683 | 2.001 | 2.081 | 2.155 |
| 7.019999999999683 | 2.002 | 2.082 | 2.156 |
| 7.029999999999683 | 2.002 | 2.082 | 2.157 |
| 7.039999999999682 | 2.003 | 2.083 | 2.157 |
| 7.049999999999682 | 2.004 | 2.084 | 2.158 |
| 7.059999999999682 | 2.005 | 2.085 | 2.159 |
| 7.069999999999682 | 2.006 | 2.085 | 2.159 |
| 7.079999999999682 | 2.007 | 2.086 | 2.16 |
| 7.089999999999681 | 2.007 | 2.087 | 2.161 |
| 7.099999999999681 | 2.008 | 2.088 | 2.162 |
| 7.109999999999681 | 2.009 | 2.089 | 2.162 |
| 7.119999999999681 | 2.01 | 2.089 | 2.163 |
| 7.129999999999681 | 2.011 | 2.09 | 2.164 |
| 7.13999999999968 | 2.012 | 2.091 | 2.164 |
| 7.14999999999968 | 2.012 | 2.092 | 2.165 |
| 7.15999999999968 | 2.013 | 2.092 | 2.166 |
| 7.16999999999968 | 2.014 | 2.093 | 2.167 |
| 7.17999999999968 | 2.015 | 2.094 | 2.167 |
| 7.18999999999968 | 2.016 | 2.095 | 2.168 |
| 7.19999999999968 | 2.017 | 2.095 | 2.169 |
| 7.20999999999968 | 2.017 | 2.096 | 2.169 |
| 7.21999999999968 | 2.018 | 2.097 | 2.17 |
| 7.229999999999678 | 2.019 | 2.098 | 2.171 |
| 7.239999999999678 | 2.02 | 2.098 | 2.172 |
| 7.249999999999678 | 2.021 | 2.099 | 2.172 |
| 7.259999999999678 | 2.021 | 2.1 | 2.173 |
| 7.269999999999678 | 2.022 | 2.101 | 2.174 |
| 7.279999999999677 | 2.023 | 2.101 | 2.174 |
| 7.289999999999677 | 2.024 | 2.102 | 2.175 |
| 7.299999999999677 | 2.025 | 2.103 | 2.176 |
| 7.309999999999677 | 2.026 | 2.104 | 2.176 |
| 7.319999999999676 | 2.026 | 2.104 | 2.177 |
| 7.329999999999676 | 2.027 | 2.105 | 2.178 |
| 7.339999999999676 | 2.028 | 2.106 | 2.179 |
| 7.349999999999676 | 2.029 | 2.107 | 2.179 |
| 7.359999999999676 | 2.03 | 2.107 | 2.18 |
| 7.369999999999675 | 2.03 | 2.108 | 2.181 |
| 7.379999999999675 | 2.031 | 2.109 | 2.181 |
| 7.389999999999675 | 2.032 | 2.11 | 2.182 |
| 7.399999999999675 | 2.033 | 2.11 | 2.183 |
| 7.409999999999675 | 2.034 | 2.111 | 2.183 |
| 7.419999999999674 | 2.034 | 2.112 | 2.184 |
| 7.429999999999674 | 2.035 | 2.113 | 2.185 |
| 7.439999999999674 | 2.036 | 2.113 | 2.186 |
| 7.449999999999674 | 2.037 | 2.114 | 2.186 |
| 7.459999999999673 | 2.038 | 2.115 | 2.187 |
| 7.469999999999673 | 2.038 | 2.116 | 2.188 |
| 7.479999999999673 | 2.039 | 2.116 | 2.188 |
| 7.489999999999673 | 2.04 | 2.117 | 2.189 |
| 7.499999999999673 | 2.041 | 2.118 | 2.19 |
| 7.509999999999672 | 2.042 | 2.119 | 2.19 |
| 7.519999999999672 | 2.042 | 2.119 | 2.191 |
| 7.529999999999672 | 2.043 | 2.12 | 2.192 |
| 7.539999999999672 | 2.044 | 2.121 | 2.193 |
| 7.549999999999672 | 2.045 | 2.122 | 2.193 |
| 7.559999999999671 | 2.046 | 2.122 | 2.194 |
| 7.569999999999671 | 2.046 | 2.123 | 2.195 |
| 7.57999999999967 | 2.047 | 2.124 | 2.195 |
| 7.58999999999967 | 2.048 | 2.125 | 2.196 |
| 7.59999999999967 | 2.049 | 2.125 | 2.197 |
| 7.60999999999967 | 2.05 | 2.126 | 2.197 |
| 7.61999999999967 | 2.05 | 2.127 | 2.198 |
| 7.62999999999967 | 2.051 | 2.128 | 2.199 |
| 7.63999999999967 | 2.052 | 2.128 | 2.199 |
| 7.64999999999967 | 2.053 | 2.129 | 2.2 |
| 7.65999999999967 | 2.054 | 2.13 | 2.201 |
| 7.66999999999967 | 2.054 | 2.13 | 2.202 |
| 7.67999999999967 | 2.055 | 2.131 | 2.202 |
| 7.689999999999668 | 2.056 | 2.132 | 2.203 |
| 7.699999999999668 | 2.057 | 2.133 | 2.204 |
| 7.709999999999668 | 2.057 | 2.133 | 2.204 |
| 7.719999999999668 | 2.058 | 2.134 | 2.205 |
| 7.729999999999668 | 2.059 | 2.135 | 2.206 |
| 7.739999999999667 | 2.06 | 2.136 | 2.206 |
| 7.749999999999667 | 2.061 | 2.136 | 2.207 |
| 7.759999999999667 | 2.061 | 2.137 | 2.208 |
| 7.769999999999667 | 2.062 | 2.138 | 2.208 |
| 7.779999999999667 | 2.063 | 2.139 | 2.209 |
| 7.789999999999666 | 2.064 | 2.139 | 2.21 |
| 7.799999999999666 | 2.065 | 2.14 | 2.21 |
| 7.809999999999666 | 2.065 | 2.141 | 2.211 |
| 7.819999999999666 | 2.066 | 2.141 | 2.212 |
| 7.829999999999666 | 2.067 | 2.142 | 2.212 |
| 7.839999999999665 | 2.068 | 2.143 | 2.213 |
| 7.849999999999665 | 2.068 | 2.144 | 2.214 |
| 7.859999999999665 | 2.069 | 2.144 | 2.215 |
| 7.869999999999665 | 2.07 | 2.145 | 2.215 |
| 7.879999999999664 | 2.071 | 2.146 | 2.216 |
| 7.889999999999664 | 2.072 | 2.147 | 2.217 |
| 7.899999999999664 | 2.072 | 2.147 | 2.217 |
| 7.909999999999664 | 2.073 | 2.148 | 2.218 |
| 7.919999999999664 | 2.074 | 2.149 | 2.219 |
| 7.929999999999663 | 2.075 | 2.149 | 2.219 |
| 7.939999999999663 | 2.075 | 2.15 | 2.22 |
| 7.949999999999663 | 2.076 | 2.151 | 2.221 |
| 7.959999999999663 | 2.077 | 2.152 | 2.221 |
| 7.969999999999663 | 2.078 | 2.152 | 2.222 |
| 7.979999999999662 | 2.079 | 2.153 | 2.223 |
| 7.989999999999662 | 2.079 | 2.154 | 2.223 |
| 7.999999999999662 | 2.08 | 2.154 | 2.224 |